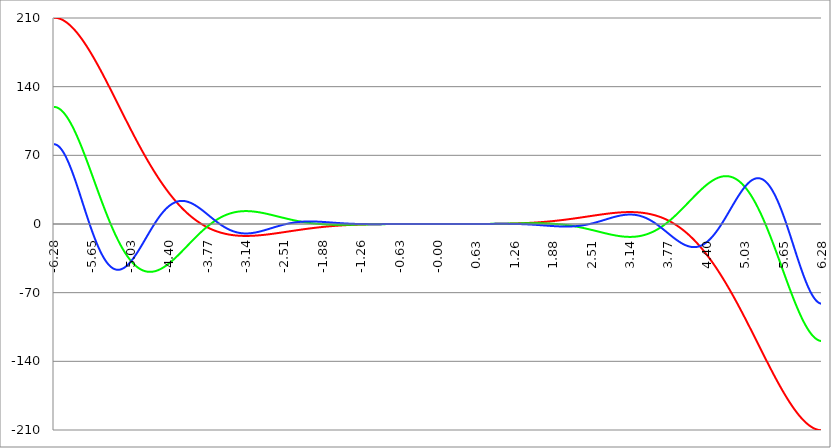
| Category | Series 1 | Series 0 | Series 2 |
|---|---|---|---|
| -6.283185307179586 | 210.351 | 119.313 | 81.287 |
| -6.276902121872407 | 210.346 | 119.303 | 81.272 |
| -6.270618936565228 | 210.332 | 119.274 | 81.229 |
| -6.264335751258049 | 210.307 | 119.225 | 81.156 |
| -6.25805256595087 | 210.273 | 119.157 | 81.054 |
| -6.25176938064369 | 210.23 | 119.07 | 80.924 |
| -6.245486195336511 | 210.177 | 118.965 | 80.765 |
| -6.23920301002933 | 210.115 | 118.84 | 80.578 |
| -6.232919824722153 | 210.043 | 118.696 | 80.364 |
| -6.226636639414973 | 209.962 | 118.535 | 80.121 |
| -6.220353454107794 | 209.871 | 118.354 | 79.852 |
| -6.214070268800615 | 209.772 | 118.155 | 79.555 |
| -6.207787083493435 | 209.663 | 117.939 | 79.231 |
| -6.201503898186257 | 209.545 | 117.704 | 78.881 |
| -6.195220712879077 | 209.419 | 117.451 | 78.504 |
| -6.188937527571898 | 209.283 | 117.181 | 78.101 |
| -6.182654342264719 | 209.138 | 116.893 | 77.673 |
| -6.17637115695754 | 208.985 | 116.588 | 77.219 |
| -6.170087971650361 | 208.823 | 116.266 | 76.74 |
| -6.163804786343182 | 208.652 | 115.926 | 76.237 |
| -6.157521601036002 | 208.472 | 115.57 | 75.709 |
| -6.151238415728823 | 208.284 | 115.196 | 75.157 |
| -6.144955230421644 | 208.087 | 114.807 | 74.581 |
| -6.138672045114464 | 207.882 | 114.401 | 73.982 |
| -6.132388859807286 | 207.669 | 113.978 | 73.36 |
| -6.126105674500106 | 207.447 | 113.54 | 72.716 |
| -6.119822489192927 | 207.217 | 113.086 | 72.049 |
| -6.113539303885748 | 206.979 | 112.616 | 71.36 |
| -6.107256118578569 | 206.732 | 112.13 | 70.65 |
| -6.10097293327139 | 206.478 | 111.629 | 69.919 |
| -6.09468974796421 | 206.215 | 111.113 | 69.167 |
| -6.088406562657031 | 205.945 | 110.582 | 68.394 |
| -6.082123377349852 | 205.666 | 110.036 | 67.602 |
| -6.075840192042672 | 205.38 | 109.475 | 66.791 |
| -6.069557006735494 | 205.086 | 108.9 | 65.96 |
| -6.063273821428314 | 204.784 | 108.311 | 65.111 |
| -6.056990636121135 | 204.475 | 107.708 | 64.243 |
| -6.050707450813956 | 204.158 | 107.091 | 63.358 |
| -6.044424265506777 | 203.834 | 106.46 | 62.456 |
| -6.038141080199597 | 203.502 | 105.815 | 61.536 |
| -6.031857894892418 | 203.162 | 105.158 | 60.6 |
| -6.025574709585239 | 202.816 | 104.487 | 59.649 |
| -6.01929152427806 | 202.462 | 103.803 | 58.681 |
| -6.013008338970881 | 202.101 | 103.107 | 57.699 |
| -6.006725153663701 | 201.733 | 102.398 | 56.702 |
| -6.000441968356522 | 201.358 | 101.676 | 55.69 |
| -5.994158783049343 | 200.975 | 100.943 | 54.665 |
| -5.987875597742164 | 200.586 | 100.198 | 53.627 |
| -5.981592412434984 | 200.19 | 99.441 | 52.576 |
| -5.975309227127805 | 199.787 | 98.672 | 51.512 |
| -5.969026041820626 | 199.378 | 97.892 | 50.437 |
| -5.962742856513447 | 198.962 | 97.101 | 49.35 |
| -5.956459671206268 | 198.539 | 96.299 | 48.253 |
| -5.950176485899088 | 198.109 | 95.487 | 47.145 |
| -5.94389330059191 | 197.673 | 94.664 | 46.027 |
| -5.93761011528473 | 197.231 | 93.831 | 44.899 |
| -5.931326929977551 | 196.782 | 92.987 | 43.763 |
| -5.925043744670372 | 196.327 | 92.134 | 42.618 |
| -5.918760559363193 | 195.866 | 91.271 | 41.464 |
| -5.912477374056014 | 195.399 | 90.399 | 40.304 |
| -5.906194188748834 | 194.925 | 89.517 | 39.136 |
| -5.899911003441655 | 194.446 | 88.626 | 37.961 |
| -5.893627818134476 | 193.96 | 87.727 | 36.781 |
| -5.887344632827297 | 193.469 | 86.819 | 35.594 |
| -5.881061447520117 | 192.971 | 85.902 | 34.402 |
| -5.874778262212938 | 192.468 | 84.978 | 33.206 |
| -5.868495076905759 | 191.96 | 84.045 | 32.005 |
| -5.86221189159858 | 191.445 | 83.105 | 30.801 |
| -5.855928706291401 | 190.925 | 82.157 | 29.593 |
| -5.849645520984221 | 190.399 | 81.201 | 28.382 |
| -5.843362335677042 | 189.868 | 80.239 | 27.169 |
| -5.837079150369863 | 189.332 | 79.27 | 25.954 |
| -5.830795965062684 | 188.79 | 78.294 | 24.737 |
| -5.824512779755505 | 188.243 | 77.311 | 23.52 |
| -5.818229594448325 | 187.691 | 76.322 | 22.301 |
| -5.811946409141146 | 187.133 | 75.327 | 21.083 |
| -5.805663223833967 | 186.571 | 74.326 | 19.865 |
| -5.799380038526788 | 186.003 | 73.32 | 18.647 |
| -5.793096853219609 | 185.431 | 72.308 | 17.431 |
| -5.78681366791243 | 184.853 | 71.291 | 16.217 |
| -5.780530482605251 | 184.271 | 70.268 | 15.004 |
| -5.774247297298071 | 183.684 | 69.241 | 13.794 |
| -5.767964111990892 | 183.092 | 68.21 | 12.588 |
| -5.761680926683713 | 182.496 | 67.174 | 11.384 |
| -5.755397741376534 | 181.895 | 66.133 | 10.184 |
| -5.749114556069355 | 181.289 | 65.089 | 8.989 |
| -5.742831370762175 | 180.679 | 64.041 | 7.798 |
| -5.736548185454996 | 180.065 | 62.989 | 6.612 |
| -5.730265000147816 | 179.446 | 61.934 | 5.431 |
| -5.723981814840638 | 178.823 | 60.876 | 4.256 |
| -5.717698629533459 | 178.196 | 59.814 | 3.088 |
| -5.711415444226279 | 177.565 | 58.75 | 1.926 |
| -5.7051322589191 | 176.929 | 57.684 | 0.771 |
| -5.698849073611921 | 176.29 | 56.615 | -0.376 |
| -5.692565888304742 | 175.646 | 55.544 | -1.516 |
| -5.686282702997562 | 174.999 | 54.47 | -2.647 |
| -5.679999517690383 | 174.347 | 53.395 | -3.771 |
| -5.673716332383204 | 173.692 | 52.319 | -4.885 |
| -5.667433147076025 | 173.034 | 51.241 | -5.99 |
| -5.661149961768846 | 172.371 | 50.162 | -7.085 |
| -5.654866776461667 | 171.705 | 49.082 | -8.171 |
| -5.648583591154487 | 171.036 | 48.001 | -9.246 |
| -5.642300405847308 | 170.362 | 46.919 | -10.311 |
| -5.63601722054013 | 169.686 | 45.837 | -11.365 |
| -5.62973403523295 | 169.006 | 44.755 | -12.408 |
| -5.623450849925771 | 168.323 | 43.673 | -13.439 |
| -5.617167664618591 | 167.636 | 42.59 | -14.459 |
| -5.610884479311412 | 166.947 | 41.509 | -15.466 |
| -5.604601294004233 | 166.254 | 40.427 | -16.461 |
| -5.598318108697054 | 165.558 | 39.347 | -17.444 |
| -5.592034923389875 | 164.859 | 38.267 | -18.413 |
| -5.585751738082695 | 164.157 | 37.188 | -19.369 |
| -5.579468552775516 | 163.453 | 36.111 | -20.312 |
| -5.573185367468337 | 162.745 | 35.035 | -21.241 |
| -5.566902182161157 | 162.035 | 33.96 | -22.156 |
| -5.560618996853979 | 161.322 | 32.887 | -23.056 |
| -5.5543358115468 | 160.606 | 31.817 | -23.943 |
| -5.54805262623962 | 159.888 | 30.748 | -24.814 |
| -5.54176944093244 | 159.167 | 29.682 | -25.671 |
| -5.535486255625262 | 158.443 | 28.618 | -26.512 |
| -5.529203070318083 | 157.717 | 27.556 | -27.338 |
| -5.522919885010904 | 156.989 | 26.498 | -28.149 |
| -5.516636699703724 | 156.259 | 25.442 | -28.944 |
| -5.510353514396545 | 155.526 | 24.389 | -29.723 |
| -5.504070329089366 | 154.791 | 23.34 | -30.485 |
| -5.497787143782186 | 154.053 | 22.294 | -31.232 |
| -5.491503958475008 | 153.314 | 21.252 | -31.962 |
| -5.485220773167828 | 152.573 | 20.213 | -32.675 |
| -5.47893758786065 | 151.829 | 19.179 | -33.372 |
| -5.47265440255347 | 151.084 | 18.148 | -34.052 |
| -5.466371217246291 | 150.337 | 17.122 | -34.715 |
| -5.460088031939112 | 149.588 | 16.1 | -35.36 |
| -5.453804846631932 | 148.837 | 15.082 | -35.988 |
| -5.447521661324753 | 148.084 | 14.069 | -36.599 |
| -5.441238476017574 | 147.33 | 13.061 | -37.193 |
| -5.434955290710395 | 146.574 | 12.058 | -37.769 |
| -5.428672105403215 | 145.817 | 11.059 | -38.327 |
| -5.422388920096036 | 145.058 | 10.066 | -38.867 |
| -5.416105734788857 | 144.298 | 9.079 | -39.39 |
| -5.409822549481678 | 143.536 | 8.096 | -39.894 |
| -5.403539364174499 | 142.773 | 7.12 | -40.381 |
| -5.39725617886732 | 142.008 | 6.149 | -40.849 |
| -5.39097299356014 | 141.242 | 5.184 | -41.3 |
| -5.384689808252961 | 140.475 | 4.225 | -41.732 |
| -5.378406622945782 | 139.707 | 3.272 | -42.146 |
| -5.372123437638603 | 138.938 | 2.325 | -42.542 |
| -5.365840252331424 | 138.168 | 1.385 | -42.92 |
| -5.359557067024244 | 137.397 | 0.451 | -43.28 |
| -5.353273881717065 | 136.625 | -0.476 | -43.621 |
| -5.346990696409886 | 135.851 | -1.397 | -43.944 |
| -5.340707511102707 | 135.078 | -2.31 | -44.249 |
| -5.334424325795528 | 134.303 | -3.217 | -44.535 |
| -5.328141140488348 | 133.527 | -4.117 | -44.804 |
| -5.32185795518117 | 132.751 | -5.01 | -45.054 |
| -5.31557476987399 | 131.974 | -5.895 | -45.287 |
| -5.30929158456681 | 131.197 | -6.773 | -45.501 |
| -5.303008399259631 | 130.419 | -7.644 | -45.697 |
| -5.296725213952453 | 129.64 | -8.507 | -45.875 |
| -5.290442028645273 | 128.861 | -9.362 | -46.035 |
| -5.284158843338094 | 128.082 | -10.21 | -46.178 |
| -5.277875658030915 | 127.302 | -11.049 | -46.302 |
| -5.271592472723735 | 126.522 | -11.881 | -46.409 |
| -5.265309287416557 | 125.742 | -12.705 | -46.499 |
| -5.259026102109377 | 124.961 | -13.521 | -46.57 |
| -5.252742916802198 | 124.18 | -14.328 | -46.625 |
| -5.246459731495019 | 123.399 | -15.128 | -46.662 |
| -5.24017654618784 | 122.618 | -15.919 | -46.682 |
| -5.23389336088066 | 121.837 | -16.701 | -46.685 |
| -5.227610175573481 | 121.056 | -17.475 | -46.671 |
| -5.221326990266302 | 120.275 | -18.241 | -46.64 |
| -5.215043804959122 | 119.494 | -18.997 | -46.592 |
| -5.208760619651944 | 118.713 | -19.745 | -46.528 |
| -5.202477434344764 | 117.932 | -20.485 | -46.447 |
| -5.196194249037585 | 117.152 | -21.215 | -46.35 |
| -5.189911063730406 | 116.372 | -21.937 | -46.237 |
| -5.183627878423227 | 115.592 | -22.649 | -46.108 |
| -5.177344693116048 | 114.812 | -23.353 | -45.963 |
| -5.171061507808868 | 114.033 | -24.047 | -45.803 |
| -5.164778322501689 | 113.254 | -24.732 | -45.627 |
| -5.15849513719451 | 112.476 | -25.408 | -45.436 |
| -5.152211951887331 | 111.698 | -26.075 | -45.23 |
| -5.145928766580152 | 110.921 | -26.732 | -45.009 |
| -5.139645581272972 | 110.144 | -27.381 | -44.773 |
| -5.133362395965793 | 109.368 | -28.019 | -44.523 |
| -5.127079210658614 | 108.593 | -28.649 | -44.258 |
| -5.120796025351435 | 107.818 | -29.268 | -43.979 |
| -5.114512840044256 | 107.044 | -29.879 | -43.686 |
| -5.108229654737076 | 106.271 | -30.479 | -43.38 |
| -5.101946469429897 | 105.499 | -31.07 | -43.06 |
| -5.095663284122718 | 104.727 | -31.652 | -42.727 |
| -5.08938009881554 | 103.956 | -32.224 | -42.381 |
| -5.08309691350836 | 103.187 | -32.786 | -42.022 |
| -5.07681372820118 | 102.418 | -33.338 | -41.65 |
| -5.070530542894002 | 101.651 | -33.881 | -41.266 |
| -5.064247357586822 | 100.884 | -34.414 | -40.87 |
| -5.057964172279643 | 100.118 | -34.937 | -40.462 |
| -5.051680986972464 | 99.354 | -35.45 | -40.042 |
| -5.045397801665285 | 98.591 | -35.954 | -39.611 |
| -5.039114616358106 | 97.829 | -36.448 | -39.169 |
| -5.032831431050926 | 97.068 | -36.931 | -38.716 |
| -5.026548245743747 | 96.308 | -37.405 | -38.252 |
| -5.020265060436568 | 95.55 | -37.87 | -37.778 |
| -5.013981875129389 | 94.793 | -38.324 | -37.293 |
| -5.00769868982221 | 94.038 | -38.768 | -36.799 |
| -5.00141550451503 | 93.283 | -39.203 | -36.295 |
| -4.995132319207851 | 92.531 | -39.627 | -35.782 |
| -4.98884913390067 | 91.779 | -40.042 | -35.26 |
| -4.982565948593493 | 91.03 | -40.447 | -34.728 |
| -4.976282763286313 | 90.281 | -40.841 | -34.189 |
| -4.969999577979134 | 89.535 | -41.226 | -33.64 |
| -4.963716392671955 | 88.79 | -41.602 | -33.084 |
| -4.957433207364776 | 88.046 | -41.967 | -32.52 |
| -4.951150022057597 | 87.304 | -42.322 | -31.949 |
| -4.944866836750418 | 86.564 | -42.668 | -31.37 |
| -4.938583651443238 | 85.826 | -43.004 | -30.784 |
| -4.932300466136059 | 85.089 | -43.329 | -30.192 |
| -4.92601728082888 | 84.354 | -43.646 | -29.593 |
| -4.9197340955217 | 83.621 | -43.952 | -28.988 |
| -4.913450910214521 | 82.89 | -44.248 | -28.377 |
| -4.907167724907342 | 82.161 | -44.535 | -27.76 |
| -4.900884539600163 | 81.433 | -44.812 | -27.138 |
| -4.894601354292984 | 80.708 | -45.08 | -26.511 |
| -4.888318168985805 | 79.984 | -45.338 | -25.88 |
| -4.882034983678625 | 79.262 | -45.586 | -25.243 |
| -4.875751798371446 | 78.543 | -45.824 | -24.603 |
| -4.869468613064267 | 77.825 | -46.053 | -23.958 |
| -4.863185427757088 | 77.11 | -46.273 | -23.31 |
| -4.856902242449909 | 76.396 | -46.483 | -22.658 |
| -4.85061905714273 | 75.685 | -46.683 | -22.004 |
| -4.84433587183555 | 74.976 | -46.874 | -21.346 |
| -4.838052686528371 | 74.269 | -47.056 | -20.686 |
| -4.831769501221192 | 73.564 | -47.228 | -20.023 |
| -4.825486315914013 | 72.861 | -47.391 | -19.358 |
| -4.819203130606833 | 72.161 | -47.545 | -18.691 |
| -4.812919945299654 | 71.463 | -47.689 | -18.023 |
| -4.806636759992475 | 70.767 | -47.824 | -17.354 |
| -4.800353574685296 | 70.074 | -47.951 | -16.683 |
| -4.794070389378117 | 69.382 | -48.068 | -16.012 |
| -4.787787204070938 | 68.694 | -48.176 | -15.34 |
| -4.781504018763758 | 68.007 | -48.275 | -14.668 |
| -4.77522083345658 | 67.323 | -48.365 | -13.996 |
| -4.7689376481494 | 66.642 | -48.446 | -13.324 |
| -4.762654462842221 | 65.962 | -48.519 | -12.653 |
| -4.756371277535042 | 65.286 | -48.583 | -11.982 |
| -4.750088092227862 | 64.612 | -48.638 | -11.312 |
| -4.743804906920683 | 63.94 | -48.684 | -10.644 |
| -4.737521721613504 | 63.271 | -48.722 | -9.977 |
| -4.731238536306324 | 62.604 | -48.751 | -9.311 |
| -4.724955350999146 | 61.94 | -48.772 | -8.648 |
| -4.718672165691966 | 61.279 | -48.785 | -7.987 |
| -4.712388980384787 | 60.62 | -48.789 | -7.328 |
| -4.706105795077608 | 59.964 | -48.785 | -6.672 |
| -4.699822609770429 | 59.31 | -48.772 | -6.019 |
| -4.69353942446325 | 58.659 | -48.752 | -5.368 |
| -4.68725623915607 | 58.011 | -48.723 | -4.722 |
| -4.680973053848891 | 57.366 | -48.687 | -4.078 |
| -4.674689868541712 | 56.723 | -48.643 | -3.438 |
| -4.668406683234533 | 56.083 | -48.59 | -2.803 |
| -4.662123497927354 | 55.445 | -48.53 | -2.171 |
| -4.655840312620174 | 54.811 | -48.462 | -1.544 |
| -4.649557127312995 | 54.179 | -48.387 | -0.921 |
| -4.643273942005816 | 53.55 | -48.304 | -0.303 |
| -4.636990756698637 | 52.924 | -48.214 | 0.31 |
| -4.630707571391458 | 52.301 | -48.116 | 0.918 |
| -4.624424386084279 | 51.681 | -48.011 | 1.52 |
| -4.618141200777099 | 51.063 | -47.899 | 2.117 |
| -4.61185801546992 | 50.448 | -47.779 | 2.709 |
| -4.605574830162741 | 49.837 | -47.652 | 3.294 |
| -4.599291644855561 | 49.228 | -47.519 | 3.874 |
| -4.593008459548383 | 48.622 | -47.378 | 4.447 |
| -4.586725274241203 | 48.019 | -47.231 | 5.014 |
| -4.580442088934024 | 47.419 | -47.077 | 5.575 |
| -4.574158903626845 | 46.822 | -46.916 | 6.128 |
| -4.567875718319666 | 46.228 | -46.748 | 6.675 |
| -4.561592533012487 | 45.637 | -46.575 | 7.215 |
| -4.555309347705307 | 45.048 | -46.394 | 7.748 |
| -4.549026162398128 | 44.463 | -46.207 | 8.274 |
| -4.542742977090949 | 43.881 | -46.015 | 8.792 |
| -4.53645979178377 | 43.302 | -45.815 | 9.302 |
| -4.530176606476591 | 42.726 | -45.61 | 9.805 |
| -4.523893421169412 | 42.153 | -45.399 | 10.3 |
| -4.517610235862232 | 41.583 | -45.182 | 10.788 |
| -4.511327050555053 | 41.017 | -44.959 | 11.267 |
| -4.505043865247874 | 40.453 | -44.73 | 11.738 |
| -4.498760679940694 | 39.892 | -44.496 | 12.2 |
| -4.492477494633515 | 39.335 | -44.256 | 12.655 |
| -4.486194309326336 | 38.78 | -44.011 | 13.101 |
| -4.479911124019157 | 38.229 | -43.76 | 13.538 |
| -4.473627938711977 | 37.681 | -43.504 | 13.967 |
| -4.467344753404799 | 37.136 | -43.243 | 14.387 |
| -4.46106156809762 | 36.594 | -42.977 | 14.798 |
| -4.45477838279044 | 36.055 | -42.706 | 15.2 |
| -4.44849519748326 | 35.52 | -42.43 | 15.593 |
| -4.442212012176082 | 34.987 | -42.149 | 15.977 |
| -4.435928826868903 | 34.458 | -41.863 | 16.352 |
| -4.429645641561723 | 33.932 | -41.573 | 16.718 |
| -4.423362456254544 | 33.409 | -41.278 | 17.074 |
| -4.417079270947365 | 32.89 | -40.979 | 17.422 |
| -4.410796085640185 | 32.373 | -40.675 | 17.759 |
| -4.404512900333007 | 31.86 | -40.367 | 18.088 |
| -4.398229715025827 | 31.35 | -40.055 | 18.407 |
| -4.391946529718648 | 30.843 | -39.739 | 18.716 |
| -4.38566334441147 | 30.339 | -39.418 | 19.016 |
| -4.37938015910429 | 29.839 | -39.094 | 19.307 |
| -4.373096973797111 | 29.342 | -38.766 | 19.587 |
| -4.366813788489932 | 28.848 | -38.434 | 19.858 |
| -4.360530603182752 | 28.357 | -38.099 | 20.12 |
| -4.354247417875573 | 27.87 | -37.76 | 20.372 |
| -4.347964232568394 | 27.386 | -37.418 | 20.614 |
| -4.341681047261215 | 26.905 | -37.072 | 20.847 |
| -4.335397861954035 | 26.427 | -36.724 | 21.069 |
| -4.329114676646856 | 25.953 | -36.371 | 21.282 |
| -4.322831491339677 | 25.482 | -36.016 | 21.486 |
| -4.316548306032498 | 25.014 | -35.658 | 21.68 |
| -4.310265120725319 | 24.549 | -35.297 | 21.864 |
| -4.30398193541814 | 24.088 | -34.933 | 22.038 |
| -4.29769875011096 | 23.63 | -34.567 | 22.203 |
| -4.291415564803781 | 23.175 | -34.198 | 22.359 |
| -4.285132379496602 | 22.723 | -33.826 | 22.504 |
| -4.278849194189422 | 22.275 | -33.452 | 22.64 |
| -4.272566008882244 | 21.83 | -33.076 | 22.767 |
| -4.266282823575064 | 21.388 | -32.697 | 22.884 |
| -4.259999638267885 | 20.95 | -32.316 | 22.992 |
| -4.253716452960706 | 20.514 | -31.933 | 23.09 |
| -4.247433267653527 | 20.082 | -31.548 | 23.179 |
| -4.241150082346347 | 19.654 | -31.161 | 23.259 |
| -4.234866897039168 | 19.228 | -30.773 | 23.329 |
| -4.228583711731989 | 18.806 | -30.382 | 23.39 |
| -4.22230052642481 | 18.387 | -29.99 | 23.442 |
| -4.216017341117631 | 17.971 | -29.596 | 23.485 |
| -4.209734155810452 | 17.559 | -29.201 | 23.519 |
| -4.203450970503273 | 17.15 | -28.805 | 23.544 |
| -4.197167785196093 | 16.744 | -28.407 | 23.56 |
| -4.190884599888914 | 16.341 | -28.008 | 23.567 |
| -4.184601414581734 | 15.942 | -27.608 | 23.566 |
| -4.178318229274556 | 15.546 | -27.207 | 23.556 |
| -4.172035043967377 | 15.153 | -26.805 | 23.537 |
| -4.165751858660197 | 14.763 | -26.402 | 23.51 |
| -4.159468673353018 | 14.377 | -25.998 | 23.475 |
| -4.153185488045839 | 13.994 | -25.594 | 23.431 |
| -4.14690230273866 | 13.614 | -25.188 | 23.379 |
| -4.140619117431481 | 13.237 | -24.783 | 23.318 |
| -4.134335932124301 | 12.864 | -24.377 | 23.25 |
| -4.128052746817122 | 12.493 | -23.97 | 23.174 |
| -4.121769561509943 | 12.126 | -23.563 | 23.09 |
| -4.115486376202764 | 11.762 | -23.156 | 22.998 |
| -4.109203190895584 | 11.402 | -22.749 | 22.899 |
| -4.102920005588405 | 11.044 | -22.341 | 22.792 |
| -4.096636820281226 | 10.69 | -21.934 | 22.678 |
| -4.090353634974047 | 10.339 | -21.527 | 22.556 |
| -4.084070449666868 | 9.991 | -21.12 | 22.428 |
| -4.077787264359689 | 9.646 | -20.713 | 22.292 |
| -4.071504079052509 | 9.305 | -20.306 | 22.149 |
| -4.06522089374533 | 8.967 | -19.9 | 22 |
| -4.058937708438151 | 8.631 | -19.494 | 21.843 |
| -4.052654523130972 | 8.299 | -19.088 | 21.68 |
| -4.046371337823793 | 7.971 | -18.684 | 21.511 |
| -4.040088152516613 | 7.645 | -18.28 | 21.336 |
| -4.033804967209434 | 7.322 | -17.876 | 21.154 |
| -4.027521781902255 | 7.003 | -17.473 | 20.966 |
| -4.021238596595076 | 6.686 | -17.072 | 20.772 |
| -4.014955411287897 | 6.373 | -16.671 | 20.572 |
| -4.008672225980717 | 6.063 | -16.271 | 20.367 |
| -4.002389040673538 | 5.756 | -15.872 | 20.156 |
| -3.996105855366359 | 5.452 | -15.474 | 19.939 |
| -3.989822670059179 | 5.151 | -15.078 | 19.718 |
| -3.983539484752 | 4.853 | -14.683 | 19.491 |
| -3.97725629944482 | 4.559 | -14.289 | 19.259 |
| -3.97097311413764 | 4.267 | -13.896 | 19.022 |
| -3.96468992883046 | 3.978 | -13.505 | 18.781 |
| -3.958406743523281 | 3.693 | -13.115 | 18.534 |
| -3.952123558216101 | 3.41 | -12.727 | 18.284 |
| -3.945840372908922 | 3.13 | -12.34 | 18.029 |
| -3.939557187601742 | 2.854 | -11.956 | 17.77 |
| -3.933274002294562 | 2.58 | -11.572 | 17.506 |
| -3.926990816987382 | 2.31 | -11.191 | 17.239 |
| -3.920707631680203 | 2.042 | -10.811 | 16.968 |
| -3.914424446373023 | 1.778 | -10.434 | 16.694 |
| -3.908141261065844 | 1.516 | -10.058 | 16.416 |
| -3.901858075758664 | 1.257 | -9.684 | 16.134 |
| -3.895574890451484 | 1.002 | -9.312 | 15.85 |
| -3.889291705144305 | 0.749 | -8.943 | 15.562 |
| -3.883008519837125 | 0.499 | -8.575 | 15.271 |
| -3.876725334529945 | 0.252 | -8.21 | 14.978 |
| -3.870442149222766 | 0.008 | -7.847 | 14.682 |
| -3.864158963915586 | -0.233 | -7.486 | 14.383 |
| -3.857875778608407 | -0.472 | -7.127 | 14.082 |
| -3.851592593301227 | -0.707 | -6.771 | 13.779 |
| -3.845309407994047 | -0.94 | -6.418 | 13.474 |
| -3.839026222686868 | -1.169 | -6.066 | 13.166 |
| -3.832743037379688 | -1.396 | -5.718 | 12.857 |
| -3.826459852072508 | -1.62 | -5.371 | 12.546 |
| -3.820176666765329 | -1.842 | -5.028 | 12.234 |
| -3.813893481458149 | -2.06 | -4.687 | 11.92 |
| -3.807610296150969 | -2.276 | -4.348 | 11.605 |
| -3.80132711084379 | -2.489 | -4.013 | 11.289 |
| -3.79504392553661 | -2.699 | -3.68 | 10.972 |
| -3.78876074022943 | -2.906 | -3.35 | 10.653 |
| -3.782477554922251 | -3.111 | -3.022 | 10.335 |
| -3.776194369615071 | -3.313 | -2.698 | 10.015 |
| -3.769911184307892 | -3.512 | -2.376 | 9.695 |
| -3.763627999000712 | -3.709 | -2.057 | 9.375 |
| -3.757344813693532 | -3.903 | -1.742 | 9.054 |
| -3.751061628386352 | -4.094 | -1.429 | 8.734 |
| -3.744778443079173 | -4.282 | -1.119 | 8.413 |
| -3.738495257771993 | -4.468 | -0.812 | 8.092 |
| -3.732212072464814 | -4.651 | -0.509 | 7.772 |
| -3.725928887157634 | -4.832 | -0.208 | 7.452 |
| -3.719645701850454 | -5.01 | 0.09 | 7.133 |
| -3.713362516543275 | -5.185 | 0.384 | 6.814 |
| -3.707079331236095 | -5.358 | 0.675 | 6.496 |
| -3.700796145928915 | -5.528 | 0.963 | 6.179 |
| -3.694512960621736 | -5.696 | 1.248 | 5.863 |
| -3.688229775314556 | -5.861 | 1.53 | 5.548 |
| -3.681946590007376 | -6.024 | 1.808 | 5.234 |
| -3.675663404700197 | -6.184 | 2.083 | 4.922 |
| -3.669380219393017 | -6.341 | 2.355 | 4.61 |
| -3.663097034085838 | -6.496 | 2.623 | 4.301 |
| -3.656813848778658 | -6.649 | 2.888 | 3.993 |
| -3.650530663471478 | -6.799 | 3.15 | 3.687 |
| -3.644247478164299 | -6.947 | 3.409 | 3.382 |
| -3.63796429285712 | -7.092 | 3.664 | 3.08 |
| -3.631681107549939 | -7.235 | 3.915 | 2.779 |
| -3.62539792224276 | -7.376 | 4.164 | 2.481 |
| -3.61911473693558 | -7.514 | 4.408 | 2.185 |
| -3.612831551628401 | -7.649 | 4.65 | 1.891 |
| -3.606548366321221 | -7.783 | 4.888 | 1.599 |
| -3.600265181014041 | -7.914 | 5.122 | 1.31 |
| -3.593981995706862 | -8.042 | 5.353 | 1.024 |
| -3.587698810399682 | -8.169 | 5.581 | 0.74 |
| -3.581415625092502 | -8.293 | 5.805 | 0.459 |
| -3.575132439785323 | -8.414 | 6.026 | 0.181 |
| -3.568849254478143 | -8.534 | 6.243 | -0.094 |
| -3.562566069170964 | -8.651 | 6.457 | -0.366 |
| -3.556282883863784 | -8.766 | 6.667 | -0.635 |
| -3.549999698556604 | -8.879 | 6.874 | -0.902 |
| -3.543716513249425 | -8.989 | 7.077 | -1.164 |
| -3.537433327942245 | -9.098 | 7.276 | -1.424 |
| -3.531150142635065 | -9.204 | 7.473 | -1.68 |
| -3.524866957327886 | -9.308 | 7.665 | -1.933 |
| -3.518583772020706 | -9.41 | 7.854 | -2.183 |
| -3.512300586713526 | -9.509 | 8.04 | -2.428 |
| -3.506017401406347 | -9.607 | 8.222 | -2.671 |
| -3.499734216099167 | -9.702 | 8.401 | -2.909 |
| -3.493451030791987 | -9.796 | 8.576 | -3.144 |
| -3.487167845484808 | -9.887 | 8.747 | -3.376 |
| -3.480884660177628 | -9.976 | 8.915 | -3.603 |
| -3.474601474870449 | -10.063 | 9.08 | -3.827 |
| -3.468318289563269 | -10.149 | 9.241 | -4.046 |
| -3.462035104256089 | -10.232 | 9.399 | -4.262 |
| -3.45575191894891 | -10.313 | 9.553 | -4.474 |
| -3.44946873364173 | -10.392 | 9.703 | -4.682 |
| -3.44318554833455 | -10.469 | 9.851 | -4.885 |
| -3.436902363027371 | -10.544 | 9.994 | -5.085 |
| -3.430619177720191 | -10.618 | 10.135 | -5.28 |
| -3.424335992413011 | -10.689 | 10.272 | -5.472 |
| -3.418052807105832 | -10.758 | 10.405 | -5.659 |
| -3.411769621798652 | -10.826 | 10.535 | -5.842 |
| -3.405486436491473 | -10.892 | 10.662 | -6.021 |
| -3.399203251184293 | -10.955 | 10.785 | -6.195 |
| -3.392920065877113 | -11.017 | 10.905 | -6.365 |
| -3.386636880569934 | -11.077 | 11.022 | -6.531 |
| -3.380353695262754 | -11.136 | 11.135 | -6.693 |
| -3.374070509955574 | -11.192 | 11.245 | -6.85 |
| -3.367787324648395 | -11.247 | 11.351 | -7.003 |
| -3.361504139341215 | -11.3 | 11.455 | -7.151 |
| -3.355220954034035 | -11.351 | 11.555 | -7.295 |
| -3.348937768726855 | -11.401 | 11.651 | -7.435 |
| -3.342654583419676 | -11.448 | 11.745 | -7.57 |
| -3.336371398112496 | -11.494 | 11.835 | -7.701 |
| -3.330088212805317 | -11.539 | 11.922 | -7.828 |
| -3.323805027498137 | -11.581 | 12.006 | -7.95 |
| -3.317521842190957 | -11.622 | 12.086 | -8.067 |
| -3.311238656883778 | -11.662 | 12.164 | -8.181 |
| -3.304955471576598 | -11.699 | 12.238 | -8.29 |
| -3.298672286269419 | -11.735 | 12.31 | -8.394 |
| -3.292389100962239 | -11.77 | 12.378 | -8.495 |
| -3.286105915655059 | -11.803 | 12.443 | -8.59 |
| -3.27982273034788 | -11.834 | 12.505 | -8.682 |
| -3.2735395450407 | -11.864 | 12.564 | -8.769 |
| -3.26725635973352 | -11.892 | 12.62 | -8.852 |
| -3.260973174426341 | -11.919 | 12.673 | -8.93 |
| -3.254689989119161 | -11.944 | 12.723 | -9.005 |
| -3.248406803811982 | -11.968 | 12.77 | -9.075 |
| -3.242123618504802 | -11.99 | 12.814 | -9.14 |
| -3.235840433197622 | -12.011 | 12.856 | -9.202 |
| -3.229557247890442 | -12.03 | 12.894 | -9.259 |
| -3.223274062583263 | -12.048 | 12.93 | -9.312 |
| -3.216990877276083 | -12.064 | 12.962 | -9.361 |
| -3.210707691968904 | -12.079 | 12.992 | -9.406 |
| -3.204424506661724 | -12.093 | 13.02 | -9.447 |
| -3.198141321354544 | -12.105 | 13.044 | -9.484 |
| -3.191858136047365 | -12.116 | 13.066 | -9.516 |
| -3.185574950740185 | -12.126 | 13.085 | -9.545 |
| -3.179291765433005 | -12.134 | 13.102 | -9.57 |
| -3.173008580125826 | -12.141 | 13.116 | -9.591 |
| -3.166725394818646 | -12.147 | 13.127 | -9.607 |
| -3.160442209511467 | -12.151 | 13.136 | -9.621 |
| -3.154159024204287 | -12.154 | 13.142 | -9.63 |
| -3.147875838897107 | -12.156 | 13.146 | -9.635 |
| -3.141592653589928 | -12.157 | 13.147 | -9.637 |
| -3.135309468282748 | -12.156 | 13.146 | -9.635 |
| -3.129026282975568 | -12.154 | 13.142 | -9.63 |
| -3.122743097668389 | -12.151 | 13.136 | -9.621 |
| -3.116459912361209 | -12.147 | 13.128 | -9.608 |
| -3.110176727054029 | -12.142 | 13.117 | -9.592 |
| -3.10389354174685 | -12.135 | 13.104 | -9.573 |
| -3.09761035643967 | -12.128 | 13.089 | -9.55 |
| -3.09132717113249 | -12.119 | 13.071 | -9.524 |
| -3.085043985825311 | -12.109 | 13.051 | -9.494 |
| -3.078760800518131 | -12.098 | 13.03 | -9.461 |
| -3.072477615210952 | -12.086 | 13.005 | -9.425 |
| -3.066194429903772 | -12.073 | 12.979 | -9.386 |
| -3.059911244596592 | -12.059 | 12.951 | -9.344 |
| -3.053628059289413 | -12.043 | 12.921 | -9.299 |
| -3.047344873982233 | -12.027 | 12.888 | -9.251 |
| -3.041061688675053 | -12.01 | 12.854 | -9.2 |
| -3.034778503367874 | -11.992 | 12.818 | -9.146 |
| -3.028495318060694 | -11.973 | 12.78 | -9.089 |
| -3.022212132753515 | -11.952 | 12.74 | -9.03 |
| -3.015928947446335 | -11.931 | 12.698 | -8.968 |
| -3.009645762139155 | -11.909 | 12.654 | -8.903 |
| -3.003362576831975 | -11.886 | 12.608 | -8.836 |
| -2.997079391524796 | -11.862 | 12.561 | -8.766 |
| -2.990796206217616 | -11.837 | 12.512 | -8.694 |
| -2.984513020910436 | -11.812 | 12.461 | -8.619 |
| -2.978229835603257 | -11.785 | 12.409 | -8.542 |
| -2.971946650296077 | -11.758 | 12.355 | -8.463 |
| -2.965663464988898 | -11.729 | 12.299 | -8.381 |
| -2.959380279681718 | -11.7 | 12.242 | -8.298 |
| -2.953097094374538 | -11.67 | 12.183 | -8.212 |
| -2.946813909067359 | -11.64 | 12.123 | -8.124 |
| -2.94053072376018 | -11.608 | 12.061 | -8.035 |
| -2.934247538453 | -11.576 | 11.997 | -7.943 |
| -2.92796435314582 | -11.543 | 11.933 | -7.85 |
| -2.92168116783864 | -11.509 | 11.867 | -7.754 |
| -2.915397982531461 | -11.475 | 11.799 | -7.658 |
| -2.909114797224281 | -11.439 | 11.731 | -7.559 |
| -2.902831611917101 | -11.403 | 11.661 | -7.459 |
| -2.896548426609922 | -11.367 | 11.589 | -7.357 |
| -2.890265241302742 | -11.329 | 11.517 | -7.254 |
| -2.883982055995562 | -11.291 | 11.443 | -7.149 |
| -2.877698870688383 | -11.252 | 11.368 | -7.044 |
| -2.871415685381203 | -11.213 | 11.292 | -6.936 |
| -2.865132500074023 | -11.173 | 11.215 | -6.828 |
| -2.858849314766844 | -11.132 | 11.137 | -6.718 |
| -2.852566129459664 | -11.091 | 11.058 | -6.608 |
| -2.846282944152485 | -11.049 | 10.978 | -6.496 |
| -2.839999758845305 | -11.007 | 10.897 | -6.383 |
| -2.833716573538125 | -10.964 | 10.815 | -6.27 |
| -2.827433388230946 | -10.92 | 10.732 | -6.155 |
| -2.821150202923766 | -10.876 | 10.648 | -6.04 |
| -2.814867017616586 | -10.831 | 10.563 | -5.924 |
| -2.808583832309407 | -10.786 | 10.477 | -5.807 |
| -2.802300647002227 | -10.74 | 10.391 | -5.69 |
| -2.796017461695047 | -10.694 | 10.304 | -5.572 |
| -2.789734276387867 | -10.647 | 10.216 | -5.453 |
| -2.783451091080688 | -10.6 | 10.127 | -5.335 |
| -2.777167905773509 | -10.552 | 10.038 | -5.215 |
| -2.770884720466329 | -10.504 | 9.948 | -5.095 |
| -2.764601535159149 | -10.455 | 9.857 | -4.975 |
| -2.75831834985197 | -10.406 | 9.766 | -4.855 |
| -2.75203516454479 | -10.357 | 9.674 | -4.735 |
| -2.74575197923761 | -10.307 | 9.582 | -4.614 |
| -2.739468793930431 | -10.256 | 9.489 | -4.494 |
| -2.733185608623251 | -10.206 | 9.396 | -4.373 |
| -2.726902423316071 | -10.155 | 9.302 | -4.252 |
| -2.720619238008892 | -10.103 | 9.208 | -4.132 |
| -2.714336052701712 | -10.051 | 9.114 | -4.011 |
| -2.708052867394532 | -9.999 | 9.019 | -3.891 |
| -2.701769682087352 | -9.946 | 8.923 | -3.771 |
| -2.695486496780173 | -9.893 | 8.828 | -3.651 |
| -2.689203311472993 | -9.84 | 8.732 | -3.531 |
| -2.682920126165814 | -9.787 | 8.635 | -3.412 |
| -2.676636940858634 | -9.733 | 8.539 | -3.293 |
| -2.670353755551454 | -9.678 | 8.442 | -3.175 |
| -2.664070570244275 | -9.624 | 8.345 | -3.057 |
| -2.657787384937095 | -9.569 | 8.248 | -2.939 |
| -2.651504199629916 | -9.514 | 8.151 | -2.822 |
| -2.645221014322736 | -9.459 | 8.054 | -2.706 |
| -2.638937829015556 | -9.404 | 7.956 | -2.591 |
| -2.632654643708377 | -9.348 | 7.859 | -2.476 |
| -2.626371458401197 | -9.292 | 7.761 | -2.362 |
| -2.620088273094018 | -9.236 | 7.664 | -2.248 |
| -2.613805087786838 | -9.179 | 7.566 | -2.136 |
| -2.607521902479658 | -9.123 | 7.468 | -2.024 |
| -2.601238717172478 | -9.066 | 7.371 | -1.913 |
| -2.594955531865299 | -9.009 | 7.273 | -1.803 |
| -2.588672346558119 | -8.952 | 7.176 | -1.694 |
| -2.58238916125094 | -8.894 | 7.078 | -1.586 |
| -2.57610597594376 | -8.837 | 6.981 | -1.479 |
| -2.56982279063658 | -8.779 | 6.884 | -1.373 |
| -2.563539605329401 | -8.721 | 6.787 | -1.268 |
| -2.557256420022221 | -8.664 | 6.69 | -1.164 |
| -2.550973234715042 | -8.606 | 6.594 | -1.061 |
| -2.544690049407862 | -8.547 | 6.497 | -0.959 |
| -2.538406864100682 | -8.489 | 6.401 | -0.859 |
| -2.532123678793503 | -8.431 | 6.305 | -0.76 |
| -2.525840493486323 | -8.372 | 6.21 | -0.662 |
| -2.519557308179143 | -8.314 | 6.114 | -0.565 |
| -2.513274122871964 | -8.255 | 6.019 | -0.469 |
| -2.506990937564784 | -8.197 | 5.925 | -0.375 |
| -2.500707752257604 | -8.138 | 5.83 | -0.282 |
| -2.494424566950425 | -8.079 | 5.736 | -0.191 |
| -2.488141381643245 | -8.02 | 5.643 | -0.1 |
| -2.481858196336065 | -7.961 | 5.549 | -0.012 |
| -2.475575011028886 | -7.903 | 5.457 | 0.076 |
| -2.469291825721706 | -7.844 | 5.364 | 0.162 |
| -2.463008640414527 | -7.785 | 5.272 | 0.247 |
| -2.456725455107347 | -7.726 | 5.181 | 0.33 |
| -2.450442269800167 | -7.667 | 5.09 | 0.411 |
| -2.444159084492988 | -7.608 | 4.999 | 0.492 |
| -2.437875899185808 | -7.549 | 4.909 | 0.571 |
| -2.431592713878628 | -7.49 | 4.819 | 0.648 |
| -2.425309528571449 | -7.431 | 4.73 | 0.724 |
| -2.419026343264269 | -7.372 | 4.642 | 0.798 |
| -2.412743157957089 | -7.314 | 4.554 | 0.871 |
| -2.40645997264991 | -7.255 | 4.466 | 0.942 |
| -2.40017678734273 | -7.196 | 4.38 | 1.012 |
| -2.393893602035551 | -7.137 | 4.293 | 1.08 |
| -2.387610416728371 | -7.079 | 4.208 | 1.147 |
| -2.381327231421191 | -7.02 | 4.123 | 1.212 |
| -2.375044046114012 | -6.962 | 4.038 | 1.275 |
| -2.368760860806832 | -6.904 | 3.954 | 1.337 |
| -2.362477675499652 | -6.845 | 3.871 | 1.398 |
| -2.356194490192473 | -6.787 | 3.789 | 1.457 |
| -2.349911304885293 | -6.729 | 3.707 | 1.514 |
| -2.343628119578113 | -6.671 | 3.626 | 1.57 |
| -2.337344934270934 | -6.613 | 3.545 | 1.624 |
| -2.331061748963754 | -6.556 | 3.465 | 1.677 |
| -2.324778563656574 | -6.498 | 3.386 | 1.728 |
| -2.318495378349395 | -6.441 | 3.308 | 1.777 |
| -2.312212193042215 | -6.383 | 3.23 | 1.825 |
| -2.305929007735036 | -6.326 | 3.153 | 1.872 |
| -2.299645822427856 | -6.269 | 3.077 | 1.917 |
| -2.293362637120676 | -6.212 | 3.001 | 1.96 |
| -2.287079451813496 | -6.155 | 2.926 | 2.002 |
| -2.280796266506317 | -6.099 | 2.852 | 2.042 |
| -2.274513081199137 | -6.042 | 2.779 | 2.081 |
| -2.268229895891957 | -5.986 | 2.706 | 2.118 |
| -2.261946710584778 | -5.93 | 2.635 | 2.154 |
| -2.255663525277598 | -5.874 | 2.564 | 2.188 |
| -2.249380339970419 | -5.818 | 2.493 | 2.221 |
| -2.24309715466324 | -5.762 | 2.424 | 2.253 |
| -2.23681396935606 | -5.707 | 2.355 | 2.282 |
| -2.23053078404888 | -5.652 | 2.287 | 2.311 |
| -2.2242475987417 | -5.597 | 2.22 | 2.338 |
| -2.217964413434521 | -5.542 | 2.154 | 2.363 |
| -2.211681228127341 | -5.487 | 2.088 | 2.387 |
| -2.205398042820161 | -5.433 | 2.023 | 2.41 |
| -2.199114857512981 | -5.379 | 1.959 | 2.432 |
| -2.192831672205802 | -5.325 | 1.896 | 2.451 |
| -2.186548486898622 | -5.271 | 1.834 | 2.47 |
| -2.180265301591443 | -5.218 | 1.772 | 2.487 |
| -2.173982116284263 | -5.164 | 1.712 | 2.503 |
| -2.167698930977084 | -5.111 | 1.652 | 2.518 |
| -2.161415745669904 | -5.059 | 1.593 | 2.531 |
| -2.155132560362724 | -5.006 | 1.534 | 2.543 |
| -2.148849375055545 | -4.954 | 1.477 | 2.554 |
| -2.142566189748365 | -4.902 | 1.42 | 2.564 |
| -2.136283004441185 | -4.85 | 1.364 | 2.572 |
| -2.129999819134006 | -4.798 | 1.309 | 2.579 |
| -2.123716633826826 | -4.747 | 1.255 | 2.585 |
| -2.117433448519646 | -4.696 | 1.202 | 2.589 |
| -2.111150263212467 | -4.645 | 1.149 | 2.593 |
| -2.104867077905287 | -4.594 | 1.097 | 2.595 |
| -2.098583892598107 | -4.544 | 1.046 | 2.597 |
| -2.092300707290928 | -4.494 | 0.996 | 2.597 |
| -2.086017521983748 | -4.444 | 0.947 | 2.596 |
| -2.079734336676569 | -4.395 | 0.899 | 2.594 |
| -2.073451151369389 | -4.345 | 0.851 | 2.591 |
| -2.06716796606221 | -4.297 | 0.804 | 2.587 |
| -2.06088478075503 | -4.248 | 0.758 | 2.582 |
| -2.05460159544785 | -4.2 | 0.713 | 2.576 |
| -2.04831841014067 | -4.151 | 0.668 | 2.569 |
| -2.042035224833491 | -4.104 | 0.624 | 2.561 |
| -2.035752039526311 | -4.056 | 0.582 | 2.552 |
| -2.029468854219131 | -4.009 | 0.539 | 2.543 |
| -2.023185668911951 | -3.962 | 0.498 | 2.532 |
| -2.016902483604772 | -3.915 | 0.458 | 2.52 |
| -2.010619298297592 | -3.869 | 0.418 | 2.508 |
| -2.004336112990412 | -3.823 | 0.379 | 2.495 |
| -1.998052927683233 | -3.777 | 0.341 | 2.481 |
| -1.991769742376054 | -3.732 | 0.303 | 2.467 |
| -1.985486557068874 | -3.686 | 0.267 | 2.451 |
| -1.979203371761694 | -3.642 | 0.231 | 2.435 |
| -1.972920186454515 | -3.597 | 0.196 | 2.418 |
| -1.966637001147335 | -3.553 | 0.161 | 2.401 |
| -1.960353815840155 | -3.509 | 0.128 | 2.382 |
| -1.954070630532976 | -3.465 | 0.095 | 2.364 |
| -1.947787445225796 | -3.422 | 0.063 | 2.344 |
| -1.941504259918616 | -3.379 | 0.031 | 2.324 |
| -1.935221074611437 | -3.336 | 0 | 2.303 |
| -1.928937889304257 | -3.294 | -0.029 | 2.282 |
| -1.922654703997078 | -3.252 | -0.059 | 2.26 |
| -1.916371518689898 | -3.21 | -0.087 | 2.238 |
| -1.910088333382718 | -3.168 | -0.115 | 2.215 |
| -1.903805148075539 | -3.127 | -0.142 | 2.192 |
| -1.897521962768359 | -3.087 | -0.169 | 2.168 |
| -1.891238777461179 | -3.046 | -0.194 | 2.144 |
| -1.884955592154 | -3.006 | -0.22 | 2.12 |
| -1.87867240684682 | -2.966 | -0.244 | 2.095 |
| -1.87238922153964 | -2.926 | -0.268 | 2.07 |
| -1.866106036232461 | -2.887 | -0.291 | 2.044 |
| -1.859822850925281 | -2.848 | -0.313 | 2.018 |
| -1.853539665618102 | -2.81 | -0.335 | 1.992 |
| -1.847256480310922 | -2.771 | -0.356 | 1.965 |
| -1.840973295003742 | -2.734 | -0.376 | 1.938 |
| -1.834690109696563 | -2.696 | -0.396 | 1.911 |
| -1.828406924389383 | -2.659 | -0.416 | 1.884 |
| -1.822123739082203 | -2.622 | -0.434 | 1.856 |
| -1.815840553775024 | -2.585 | -0.452 | 1.828 |
| -1.809557368467844 | -2.549 | -0.47 | 1.8 |
| -1.803274183160664 | -2.513 | -0.486 | 1.772 |
| -1.796990997853485 | -2.477 | -0.503 | 1.744 |
| -1.790707812546305 | -2.442 | -0.518 | 1.715 |
| -1.784424627239125 | -2.407 | -0.533 | 1.687 |
| -1.778141441931946 | -2.372 | -0.548 | 1.658 |
| -1.771858256624766 | -2.337 | -0.562 | 1.629 |
| -1.765575071317587 | -2.303 | -0.575 | 1.6 |
| -1.759291886010407 | -2.27 | -0.588 | 1.572 |
| -1.753008700703227 | -2.236 | -0.6 | 1.543 |
| -1.746725515396048 | -2.203 | -0.612 | 1.514 |
| -1.740442330088868 | -2.17 | -0.624 | 1.485 |
| -1.734159144781688 | -2.138 | -0.634 | 1.456 |
| -1.727875959474509 | -2.105 | -0.645 | 1.427 |
| -1.72159277416733 | -2.074 | -0.654 | 1.398 |
| -1.715309588860149 | -2.042 | -0.664 | 1.369 |
| -1.70902640355297 | -2.011 | -0.672 | 1.341 |
| -1.70274321824579 | -1.98 | -0.681 | 1.312 |
| -1.69646003293861 | -1.949 | -0.689 | 1.283 |
| -1.690176847631431 | -1.919 | -0.696 | 1.255 |
| -1.683893662324251 | -1.889 | -0.703 | 1.227 |
| -1.677610477017072 | -1.859 | -0.709 | 1.198 |
| -1.671327291709892 | -1.83 | -0.716 | 1.17 |
| -1.665044106402712 | -1.801 | -0.721 | 1.142 |
| -1.658760921095533 | -1.772 | -0.726 | 1.115 |
| -1.652477735788353 | -1.744 | -0.731 | 1.087 |
| -1.646194550481173 | -1.716 | -0.736 | 1.06 |
| -1.639911365173994 | -1.688 | -0.74 | 1.032 |
| -1.633628179866814 | -1.661 | -0.743 | 1.005 |
| -1.627344994559634 | -1.633 | -0.746 | 0.979 |
| -1.621061809252455 | -1.606 | -0.749 | 0.952 |
| -1.614778623945275 | -1.58 | -0.752 | 0.926 |
| -1.608495438638096 | -1.554 | -0.754 | 0.9 |
| -1.602212253330916 | -1.528 | -0.756 | 0.874 |
| -1.595929068023736 | -1.502 | -0.757 | 0.848 |
| -1.589645882716557 | -1.477 | -0.758 | 0.823 |
| -1.583362697409377 | -1.451 | -0.759 | 0.798 |
| -1.577079512102197 | -1.427 | -0.76 | 0.773 |
| -1.570796326795018 | -1.402 | -0.76 | 0.748 |
| -1.564513141487838 | -1.378 | -0.76 | 0.724 |
| -1.558229956180659 | -1.354 | -0.759 | 0.7 |
| -1.551946770873479 | -1.33 | -0.758 | 0.677 |
| -1.545663585566299 | -1.307 | -0.757 | 0.653 |
| -1.53938040025912 | -1.284 | -0.756 | 0.63 |
| -1.53309721495194 | -1.261 | -0.755 | 0.608 |
| -1.52681402964476 | -1.239 | -0.753 | 0.585 |
| -1.520530844337581 | -1.217 | -0.751 | 0.563 |
| -1.514247659030401 | -1.195 | -0.748 | 0.542 |
| -1.507964473723221 | -1.173 | -0.746 | 0.52 |
| -1.501681288416042 | -1.152 | -0.743 | 0.499 |
| -1.495398103108862 | -1.131 | -0.74 | 0.479 |
| -1.489114917801682 | -1.11 | -0.737 | 0.458 |
| -1.482831732494503 | -1.089 | -0.733 | 0.439 |
| -1.476548547187323 | -1.069 | -0.729 | 0.419 |
| -1.470265361880144 | -1.049 | -0.726 | 0.4 |
| -1.463982176572964 | -1.029 | -0.721 | 0.381 |
| -1.457698991265784 | -1.01 | -0.717 | 0.362 |
| -1.451415805958605 | -0.991 | -0.713 | 0.344 |
| -1.445132620651425 | -0.972 | -0.708 | 0.326 |
| -1.438849435344245 | -0.953 | -0.703 | 0.309 |
| -1.432566250037066 | -0.935 | -0.698 | 0.292 |
| -1.426283064729886 | -0.916 | -0.693 | 0.275 |
| -1.419999879422706 | -0.898 | -0.688 | 0.259 |
| -1.413716694115527 | -0.881 | -0.683 | 0.243 |
| -1.407433508808347 | -0.863 | -0.677 | 0.227 |
| -1.401150323501168 | -0.846 | -0.671 | 0.212 |
| -1.394867138193988 | -0.829 | -0.665 | 0.197 |
| -1.388583952886808 | -0.813 | -0.66 | 0.182 |
| -1.382300767579629 | -0.796 | -0.653 | 0.168 |
| -1.376017582272449 | -0.78 | -0.647 | 0.154 |
| -1.369734396965269 | -0.764 | -0.641 | 0.141 |
| -1.36345121165809 | -0.748 | -0.635 | 0.128 |
| -1.35716802635091 | -0.733 | -0.628 | 0.115 |
| -1.35088484104373 | -0.718 | -0.622 | 0.102 |
| -1.344601655736551 | -0.703 | -0.615 | 0.09 |
| -1.338318470429371 | -0.688 | -0.608 | 0.079 |
| -1.332035285122191 | -0.673 | -0.602 | 0.067 |
| -1.325752099815012 | -0.659 | -0.595 | 0.056 |
| -1.319468914507832 | -0.645 | -0.588 | 0.046 |
| -1.313185729200653 | -0.631 | -0.581 | 0.035 |
| -1.306902543893473 | -0.617 | -0.574 | 0.025 |
| -1.300619358586293 | -0.604 | -0.567 | 0.016 |
| -1.294336173279114 | -0.591 | -0.559 | 0.006 |
| -1.288052987971934 | -0.578 | -0.552 | -0.003 |
| -1.281769802664754 | -0.565 | -0.545 | -0.012 |
| -1.275486617357575 | -0.552 | -0.538 | -0.02 |
| -1.269203432050395 | -0.54 | -0.531 | -0.028 |
| -1.262920246743215 | -0.528 | -0.523 | -0.036 |
| -1.256637061436036 | -0.516 | -0.516 | -0.043 |
| -1.250353876128856 | -0.504 | -0.509 | -0.051 |
| -1.244070690821677 | -0.493 | -0.501 | -0.057 |
| -1.237787505514497 | -0.481 | -0.494 | -0.064 |
| -1.231504320207317 | -0.47 | -0.487 | -0.07 |
| -1.225221134900138 | -0.459 | -0.479 | -0.076 |
| -1.218937949592958 | -0.448 | -0.472 | -0.082 |
| -1.212654764285778 | -0.438 | -0.464 | -0.088 |
| -1.206371578978599 | -0.427 | -0.457 | -0.093 |
| -1.20008839367142 | -0.417 | -0.45 | -0.098 |
| -1.193805208364239 | -0.407 | -0.442 | -0.102 |
| -1.18752202305706 | -0.397 | -0.435 | -0.107 |
| -1.18123883774988 | -0.388 | -0.428 | -0.111 |
| -1.1749556524427 | -0.378 | -0.421 | -0.115 |
| -1.168672467135521 | -0.369 | -0.413 | -0.119 |
| -1.162389281828341 | -0.36 | -0.406 | -0.122 |
| -1.156106096521162 | -0.351 | -0.399 | -0.125 |
| -1.149822911213982 | -0.342 | -0.392 | -0.128 |
| -1.143539725906802 | -0.333 | -0.385 | -0.131 |
| -1.137256540599623 | -0.325 | -0.378 | -0.134 |
| -1.130973355292443 | -0.316 | -0.371 | -0.136 |
| -1.124690169985263 | -0.308 | -0.364 | -0.138 |
| -1.118406984678084 | -0.3 | -0.357 | -0.14 |
| -1.112123799370904 | -0.293 | -0.35 | -0.142 |
| -1.105840614063724 | -0.285 | -0.343 | -0.143 |
| -1.099557428756545 | -0.277 | -0.336 | -0.145 |
| -1.093274243449365 | -0.27 | -0.329 | -0.146 |
| -1.086991058142186 | -0.263 | -0.323 | -0.147 |
| -1.080707872835006 | -0.256 | -0.316 | -0.148 |
| -1.074424687527826 | -0.249 | -0.31 | -0.149 |
| -1.068141502220647 | -0.242 | -0.303 | -0.149 |
| -1.061858316913467 | -0.235 | -0.297 | -0.15 |
| -1.055575131606287 | -0.229 | -0.29 | -0.15 |
| -1.049291946299108 | -0.222 | -0.284 | -0.15 |
| -1.043008760991928 | -0.216 | -0.278 | -0.15 |
| -1.036725575684748 | -0.21 | -0.272 | -0.15 |
| -1.030442390377569 | -0.204 | -0.265 | -0.15 |
| -1.024159205070389 | -0.198 | -0.259 | -0.149 |
| -1.01787601976321 | -0.193 | -0.254 | -0.149 |
| -1.01159283445603 | -0.187 | -0.248 | -0.148 |
| -1.00530964914885 | -0.182 | -0.242 | -0.147 |
| -0.999026463841671 | -0.176 | -0.236 | -0.146 |
| -0.992743278534491 | -0.171 | -0.23 | -0.145 |
| -0.986460093227311 | -0.166 | -0.225 | -0.144 |
| -0.980176907920132 | -0.161 | -0.219 | -0.143 |
| -0.973893722612952 | -0.156 | -0.214 | -0.142 |
| -0.967610537305772 | -0.151 | -0.209 | -0.141 |
| -0.961327351998593 | -0.147 | -0.203 | -0.139 |
| -0.955044166691413 | -0.142 | -0.198 | -0.138 |
| -0.948760981384233 | -0.138 | -0.193 | -0.136 |
| -0.942477796077054 | -0.134 | -0.188 | -0.135 |
| -0.936194610769874 | -0.129 | -0.183 | -0.133 |
| -0.929911425462695 | -0.125 | -0.178 | -0.131 |
| -0.923628240155515 | -0.121 | -0.173 | -0.13 |
| -0.917345054848335 | -0.117 | -0.168 | -0.128 |
| -0.911061869541156 | -0.114 | -0.164 | -0.126 |
| -0.904778684233976 | -0.11 | -0.159 | -0.124 |
| -0.898495498926796 | -0.106 | -0.155 | -0.122 |
| -0.892212313619617 | -0.103 | -0.15 | -0.12 |
| -0.885929128312437 | -0.099 | -0.146 | -0.118 |
| -0.879645943005257 | -0.096 | -0.142 | -0.116 |
| -0.873362757698078 | -0.093 | -0.138 | -0.114 |
| -0.867079572390898 | -0.09 | -0.134 | -0.112 |
| -0.860796387083718 | -0.086 | -0.13 | -0.11 |
| -0.854513201776539 | -0.083 | -0.126 | -0.108 |
| -0.848230016469359 | -0.081 | -0.122 | -0.106 |
| -0.84194683116218 | -0.078 | -0.118 | -0.103 |
| -0.835663645855 | -0.075 | -0.114 | -0.101 |
| -0.82938046054782 | -0.072 | -0.111 | -0.099 |
| -0.823097275240641 | -0.07 | -0.107 | -0.097 |
| -0.816814089933461 | -0.067 | -0.104 | -0.095 |
| -0.810530904626281 | -0.065 | -0.1 | -0.092 |
| -0.804247719319102 | -0.062 | -0.097 | -0.09 |
| -0.797964534011922 | -0.06 | -0.094 | -0.088 |
| -0.791681348704742 | -0.058 | -0.091 | -0.086 |
| -0.785398163397563 | -0.055 | -0.088 | -0.084 |
| -0.779114978090383 | -0.053 | -0.085 | -0.082 |
| -0.772831792783204 | -0.051 | -0.082 | -0.08 |
| -0.766548607476024 | -0.049 | -0.079 | -0.077 |
| -0.760265422168844 | -0.047 | -0.076 | -0.075 |
| -0.753982236861665 | -0.046 | -0.073 | -0.073 |
| -0.747699051554485 | -0.044 | -0.071 | -0.071 |
| -0.741415866247305 | -0.042 | -0.068 | -0.069 |
| -0.735132680940126 | -0.04 | -0.066 | -0.067 |
| -0.728849495632946 | -0.039 | -0.063 | -0.065 |
| -0.722566310325766 | -0.037 | -0.061 | -0.063 |
| -0.716283125018587 | -0.035 | -0.058 | -0.061 |
| -0.709999939711407 | -0.034 | -0.056 | -0.059 |
| -0.703716754404227 | -0.033 | -0.054 | -0.057 |
| -0.697433569097048 | -0.031 | -0.052 | -0.055 |
| -0.691150383789868 | -0.03 | -0.05 | -0.054 |
| -0.684867198482689 | -0.028 | -0.048 | -0.052 |
| -0.678584013175509 | -0.027 | -0.046 | -0.05 |
| -0.672300827868329 | -0.026 | -0.044 | -0.048 |
| -0.66601764256115 | -0.025 | -0.042 | -0.047 |
| -0.65973445725397 | -0.024 | -0.04 | -0.045 |
| -0.65345127194679 | -0.023 | -0.039 | -0.043 |
| -0.647168086639611 | -0.022 | -0.037 | -0.042 |
| -0.640884901332431 | -0.021 | -0.035 | -0.04 |
| -0.634601716025251 | -0.02 | -0.034 | -0.039 |
| -0.628318530718072 | -0.019 | -0.032 | -0.037 |
| -0.622035345410892 | -0.018 | -0.031 | -0.036 |
| -0.615752160103712 | -0.017 | -0.029 | -0.034 |
| -0.609468974796533 | -0.016 | -0.028 | -0.033 |
| -0.603185789489353 | -0.015 | -0.027 | -0.031 |
| -0.596902604182174 | -0.015 | -0.025 | -0.03 |
| -0.590619418874994 | -0.014 | -0.024 | -0.029 |
| -0.584336233567814 | -0.013 | -0.023 | -0.028 |
| -0.578053048260635 | -0.012 | -0.022 | -0.026 |
| -0.571769862953455 | -0.012 | -0.021 | -0.025 |
| -0.565486677646275 | -0.011 | -0.02 | -0.024 |
| -0.559203492339096 | -0.011 | -0.019 | -0.023 |
| -0.552920307031916 | -0.01 | -0.018 | -0.022 |
| -0.546637121724737 | -0.009 | -0.017 | -0.021 |
| -0.540353936417557 | -0.009 | -0.016 | -0.02 |
| -0.534070751110377 | -0.008 | -0.015 | -0.019 |
| -0.527787565803198 | -0.008 | -0.014 | -0.018 |
| -0.521504380496018 | -0.007 | -0.014 | -0.017 |
| -0.515221195188838 | -0.007 | -0.013 | -0.016 |
| -0.508938009881659 | -0.007 | -0.012 | -0.015 |
| -0.502654824574479 | -0.006 | -0.011 | -0.014 |
| -0.496371639267299 | -0.006 | -0.011 | -0.014 |
| -0.49008845396012 | -0.005 | -0.01 | -0.013 |
| -0.48380526865294 | -0.005 | -0.009 | -0.012 |
| -0.477522083345761 | -0.005 | -0.009 | -0.012 |
| -0.471238898038581 | -0.005 | -0.008 | -0.011 |
| -0.464955712731402 | -0.004 | -0.008 | -0.01 |
| -0.458672527424222 | -0.004 | -0.007 | -0.01 |
| -0.452389342117042 | -0.004 | -0.007 | -0.009 |
| -0.446106156809863 | -0.003 | -0.006 | -0.008 |
| -0.439822971502683 | -0.003 | -0.006 | -0.008 |
| -0.433539786195504 | -0.003 | -0.006 | -0.007 |
| -0.427256600888324 | -0.003 | -0.005 | -0.007 |
| -0.420973415581144 | -0.003 | -0.005 | -0.007 |
| -0.414690230273965 | -0.002 | -0.005 | -0.006 |
| -0.408407044966785 | -0.002 | -0.004 | -0.006 |
| -0.402123859659606 | -0.002 | -0.004 | -0.005 |
| -0.395840674352426 | -0.002 | -0.004 | -0.005 |
| -0.389557489045247 | -0.002 | -0.003 | -0.005 |
| -0.383274303738067 | -0.002 | -0.003 | -0.004 |
| -0.376991118430887 | -0.001 | -0.003 | -0.004 |
| -0.370707933123708 | -0.001 | -0.003 | -0.004 |
| -0.364424747816528 | -0.001 | -0.002 | -0.003 |
| -0.358141562509349 | -0.001 | -0.002 | -0.003 |
| -0.351858377202169 | -0.001 | -0.002 | -0.003 |
| -0.345575191894989 | -0.001 | -0.002 | -0.003 |
| -0.33929200658781 | -0.001 | -0.002 | -0.002 |
| -0.33300882128063 | -0.001 | -0.002 | -0.002 |
| -0.326725635973451 | -0.001 | -0.001 | -0.002 |
| -0.320442450666271 | -0.001 | -0.001 | -0.002 |
| -0.314159265359092 | -0.001 | -0.001 | -0.002 |
| -0.307876080051912 | -0.001 | -0.001 | -0.001 |
| -0.301592894744732 | 0 | -0.001 | -0.001 |
| -0.295309709437553 | 0 | -0.001 | -0.001 |
| -0.289026524130373 | 0 | -0.001 | -0.001 |
| -0.282743338823194 | 0 | -0.001 | -0.001 |
| -0.276460153516014 | 0 | -0.001 | -0.001 |
| -0.270176968208834 | 0 | -0.001 | -0.001 |
| -0.263893782901655 | 0 | 0 | -0.001 |
| -0.257610597594475 | 0 | 0 | -0.001 |
| -0.251327412287296 | 0 | 0 | -0.001 |
| -0.245044226980116 | 0 | 0 | 0 |
| -0.238761041672937 | 0 | 0 | 0 |
| -0.232477856365757 | 0 | 0 | 0 |
| -0.226194671058577 | 0 | 0 | 0 |
| -0.219911485751398 | 0 | 0 | 0 |
| -0.213628300444218 | 0 | 0 | 0 |
| -0.207345115137039 | 0 | 0 | 0 |
| -0.201061929829859 | 0 | 0 | 0 |
| -0.194778744522679 | 0 | 0 | 0 |
| -0.1884955592155 | 0 | 0 | 0 |
| -0.18221237390832 | 0 | 0 | 0 |
| -0.175929188601141 | 0 | 0 | 0 |
| -0.169646003293961 | 0 | 0 | 0 |
| -0.163362817986782 | 0 | 0 | 0 |
| -0.157079632679602 | 0 | 0 | 0 |
| -0.150796447372422 | 0 | 0 | 0 |
| -0.144513262065243 | 0 | 0 | 0 |
| -0.138230076758063 | 0 | 0 | 0 |
| -0.131946891450884 | 0 | 0 | 0 |
| -0.125663706143704 | 0 | 0 | 0 |
| -0.119380520836524 | 0 | 0 | 0 |
| -0.113097335529345 | 0 | 0 | 0 |
| -0.106814150222165 | 0 | 0 | 0 |
| -0.100530964914986 | 0 | 0 | 0 |
| -0.0942477796078061 | 0 | 0 | 0 |
| -0.0879645943006265 | 0 | 0 | 0 |
| -0.0816814089934469 | 0 | 0 | 0 |
| -0.0753982236862674 | 0 | 0 | 0 |
| -0.0691150383790878 | 0 | 0 | 0 |
| -0.0628318530719082 | 0 | 0 | 0 |
| -0.0565486677647286 | 0 | 0 | 0 |
| -0.050265482457549 | 0 | 0 | 0 |
| -0.0439822971503694 | 0 | 0 | 0 |
| -0.0376991118431899 | 0 | 0 | 0 |
| -0.0314159265360103 | 0 | 0 | 0 |
| -0.0251327412288307 | 0 | 0 | 0 |
| -0.0188495559216511 | 0 | 0 | 0 |
| -0.0125663706144715 | 0 | 0 | 0 |
| -0.00628318530729192 | 0 | 0 | 0 |
| -1.12338957580782e-13 | 0 | 0 | 0 |
| 0.00628318530706725 | 0 | 0 | 0 |
| 0.0125663706142468 | 0 | 0 | 0 |
| 0.0188495559214264 | 0 | 0 | 0 |
| 0.025132741228606 | 0 | 0 | 0 |
| 0.0314159265357856 | 0 | 0 | 0 |
| 0.0376991118429652 | 0 | 0 | 0 |
| 0.0439822971501448 | 0 | 0 | 0 |
| 0.0502654824573243 | 0 | 0 | 0 |
| 0.0565486677645039 | 0 | 0 | 0 |
| 0.0628318530716835 | 0 | 0 | 0 |
| 0.0691150383788631 | 0 | 0 | 0 |
| 0.0753982236860427 | 0 | 0 | 0 |
| 0.0816814089932222 | 0 | 0 | 0 |
| 0.0879645943004018 | 0 | 0 | 0 |
| 0.0942477796075814 | 0 | 0 | 0 |
| 0.100530964914761 | 0 | 0 | 0 |
| 0.106814150221941 | 0 | 0 | 0 |
| 0.11309733552912 | 0 | 0 | 0 |
| 0.1193805208363 | 0 | 0 | 0 |
| 0.125663706143479 | 0 | 0 | 0 |
| 0.131946891450659 | 0 | 0 | 0 |
| 0.138230076757839 | 0 | 0 | 0 |
| 0.144513262065018 | 0 | 0 | 0 |
| 0.150796447372198 | 0 | 0 | 0 |
| 0.157079632679377 | 0 | 0 | 0 |
| 0.163362817986557 | 0 | 0 | 0 |
| 0.169646003293736 | 0 | 0 | 0 |
| 0.175929188600916 | 0 | 0 | 0 |
| 0.182212373908096 | 0 | 0 | 0 |
| 0.188495559215275 | 0 | 0 | 0 |
| 0.194778744522455 | 0 | 0 | 0 |
| 0.201061929829634 | 0 | 0 | 0 |
| 0.207345115136814 | 0 | 0 | 0 |
| 0.213628300443994 | 0 | 0 | 0 |
| 0.219911485751173 | 0 | 0 | 0 |
| 0.226194671058353 | 0 | 0 | 0 |
| 0.232477856365532 | 0 | 0 | 0 |
| 0.238761041672712 | 0 | 0 | 0 |
| 0.245044226979891 | 0 | 0 | 0 |
| 0.251327412287071 | 0 | 0 | 0.001 |
| 0.257610597594251 | 0 | 0 | 0.001 |
| 0.26389378290143 | 0 | 0 | 0.001 |
| 0.27017696820861 | 0 | 0.001 | 0.001 |
| 0.276460153515789 | 0 | 0.001 | 0.001 |
| 0.282743338822969 | 0 | 0.001 | 0.001 |
| 0.289026524130149 | 0 | 0.001 | 0.001 |
| 0.295309709437328 | 0 | 0.001 | 0.001 |
| 0.301592894744508 | 0 | 0.001 | 0.001 |
| 0.307876080051687 | 0.001 | 0.001 | 0.001 |
| 0.314159265358867 | 0.001 | 0.001 | 0.002 |
| 0.320442450666046 | 0.001 | 0.001 | 0.002 |
| 0.326725635973226 | 0.001 | 0.001 | 0.002 |
| 0.333008821280406 | 0.001 | 0.002 | 0.002 |
| 0.339292006587585 | 0.001 | 0.002 | 0.002 |
| 0.345575191894765 | 0.001 | 0.002 | 0.003 |
| 0.351858377201944 | 0.001 | 0.002 | 0.003 |
| 0.358141562509124 | 0.001 | 0.002 | 0.003 |
| 0.364424747816304 | 0.001 | 0.002 | 0.003 |
| 0.370707933123483 | 0.001 | 0.003 | 0.004 |
| 0.376991118430663 | 0.001 | 0.003 | 0.004 |
| 0.383274303737842 | 0.002 | 0.003 | 0.004 |
| 0.389557489045022 | 0.002 | 0.003 | 0.005 |
| 0.395840674352201 | 0.002 | 0.004 | 0.005 |
| 0.402123859659381 | 0.002 | 0.004 | 0.005 |
| 0.408407044966561 | 0.002 | 0.004 | 0.006 |
| 0.41469023027374 | 0.002 | 0.005 | 0.006 |
| 0.42097341558092 | 0.003 | 0.005 | 0.007 |
| 0.427256600888099 | 0.003 | 0.005 | 0.007 |
| 0.433539786195279 | 0.003 | 0.006 | 0.007 |
| 0.439822971502459 | 0.003 | 0.006 | 0.008 |
| 0.446106156809638 | 0.003 | 0.006 | 0.008 |
| 0.452389342116818 | 0.004 | 0.007 | 0.009 |
| 0.458672527423997 | 0.004 | 0.007 | 0.01 |
| 0.464955712731177 | 0.004 | 0.008 | 0.01 |
| 0.471238898038356 | 0.005 | 0.008 | 0.011 |
| 0.477522083345536 | 0.005 | 0.009 | 0.012 |
| 0.483805268652716 | 0.005 | 0.009 | 0.012 |
| 0.490088453959895 | 0.005 | 0.01 | 0.013 |
| 0.496371639267075 | 0.006 | 0.011 | 0.014 |
| 0.502654824574254 | 0.006 | 0.011 | 0.014 |
| 0.508938009881434 | 0.007 | 0.012 | 0.015 |
| 0.515221195188614 | 0.007 | 0.013 | 0.016 |
| 0.521504380495793 | 0.007 | 0.014 | 0.017 |
| 0.527787565802973 | 0.008 | 0.014 | 0.018 |
| 0.534070751110153 | 0.008 | 0.015 | 0.019 |
| 0.540353936417332 | 0.009 | 0.016 | 0.02 |
| 0.546637121724512 | 0.009 | 0.017 | 0.021 |
| 0.552920307031692 | 0.01 | 0.018 | 0.022 |
| 0.559203492338871 | 0.011 | 0.019 | 0.023 |
| 0.565486677646051 | 0.011 | 0.02 | 0.024 |
| 0.571769862953231 | 0.012 | 0.021 | 0.025 |
| 0.57805304826041 | 0.012 | 0.022 | 0.026 |
| 0.58433623356759 | 0.013 | 0.023 | 0.028 |
| 0.590619418874769 | 0.014 | 0.024 | 0.029 |
| 0.596902604181949 | 0.015 | 0.025 | 0.03 |
| 0.603185789489129 | 0.015 | 0.027 | 0.031 |
| 0.609468974796308 | 0.016 | 0.028 | 0.033 |
| 0.615752160103488 | 0.017 | 0.029 | 0.034 |
| 0.622035345410668 | 0.018 | 0.031 | 0.036 |
| 0.628318530717847 | 0.019 | 0.032 | 0.037 |
| 0.634601716025027 | 0.02 | 0.034 | 0.039 |
| 0.640884901332206 | 0.021 | 0.035 | 0.04 |
| 0.647168086639386 | 0.022 | 0.037 | 0.042 |
| 0.653451271946566 | 0.023 | 0.039 | 0.043 |
| 0.659734457253745 | 0.024 | 0.04 | 0.045 |
| 0.666017642560925 | 0.025 | 0.042 | 0.047 |
| 0.672300827868105 | 0.026 | 0.044 | 0.048 |
| 0.678584013175284 | 0.027 | 0.046 | 0.05 |
| 0.684867198482464 | 0.028 | 0.048 | 0.052 |
| 0.691150383789644 | 0.03 | 0.05 | 0.054 |
| 0.697433569096823 | 0.031 | 0.052 | 0.055 |
| 0.703716754404003 | 0.033 | 0.054 | 0.057 |
| 0.709999939711183 | 0.034 | 0.056 | 0.059 |
| 0.716283125018362 | 0.035 | 0.058 | 0.061 |
| 0.722566310325542 | 0.037 | 0.061 | 0.063 |
| 0.728849495632721 | 0.039 | 0.063 | 0.065 |
| 0.735132680939901 | 0.04 | 0.066 | 0.067 |
| 0.741415866247081 | 0.042 | 0.068 | 0.069 |
| 0.74769905155426 | 0.044 | 0.071 | 0.071 |
| 0.75398223686144 | 0.046 | 0.073 | 0.073 |
| 0.76026542216862 | 0.047 | 0.076 | 0.075 |
| 0.766548607475799 | 0.049 | 0.079 | 0.077 |
| 0.772831792782979 | 0.051 | 0.082 | 0.08 |
| 0.779114978090159 | 0.053 | 0.085 | 0.082 |
| 0.785398163397338 | 0.055 | 0.088 | 0.084 |
| 0.791681348704518 | 0.058 | 0.091 | 0.086 |
| 0.797964534011697 | 0.06 | 0.094 | 0.088 |
| 0.804247719318877 | 0.062 | 0.097 | 0.09 |
| 0.810530904626057 | 0.065 | 0.1 | 0.092 |
| 0.816814089933236 | 0.067 | 0.104 | 0.095 |
| 0.823097275240416 | 0.07 | 0.107 | 0.097 |
| 0.829380460547596 | 0.072 | 0.111 | 0.099 |
| 0.835663645854775 | 0.075 | 0.114 | 0.101 |
| 0.841946831161955 | 0.078 | 0.118 | 0.103 |
| 0.848230016469135 | 0.081 | 0.122 | 0.106 |
| 0.854513201776314 | 0.083 | 0.126 | 0.108 |
| 0.860796387083494 | 0.086 | 0.13 | 0.11 |
| 0.867079572390674 | 0.09 | 0.134 | 0.112 |
| 0.873362757697853 | 0.093 | 0.138 | 0.114 |
| 0.879645943005033 | 0.096 | 0.142 | 0.116 |
| 0.885929128312212 | 0.099 | 0.146 | 0.118 |
| 0.892212313619392 | 0.103 | 0.15 | 0.12 |
| 0.898495498926572 | 0.106 | 0.155 | 0.122 |
| 0.904778684233751 | 0.11 | 0.159 | 0.124 |
| 0.911061869540931 | 0.114 | 0.164 | 0.126 |
| 0.917345054848111 | 0.117 | 0.168 | 0.128 |
| 0.92362824015529 | 0.121 | 0.173 | 0.13 |
| 0.92991142546247 | 0.125 | 0.178 | 0.131 |
| 0.93619461076965 | 0.129 | 0.183 | 0.133 |
| 0.942477796076829 | 0.134 | 0.188 | 0.135 |
| 0.948760981384009 | 0.138 | 0.193 | 0.136 |
| 0.955044166691188 | 0.142 | 0.198 | 0.138 |
| 0.961327351998368 | 0.147 | 0.203 | 0.139 |
| 0.967610537305548 | 0.151 | 0.209 | 0.141 |
| 0.973893722612727 | 0.156 | 0.214 | 0.142 |
| 0.980176907919907 | 0.161 | 0.219 | 0.143 |
| 0.986460093227087 | 0.166 | 0.225 | 0.144 |
| 0.992743278534266 | 0.171 | 0.23 | 0.145 |
| 0.999026463841446 | 0.176 | 0.236 | 0.146 |
| 1.005309649148626 | 0.182 | 0.242 | 0.147 |
| 1.011592834455805 | 0.187 | 0.248 | 0.148 |
| 1.017876019762985 | 0.193 | 0.254 | 0.149 |
| 1.024159205070164 | 0.198 | 0.259 | 0.149 |
| 1.030442390377344 | 0.204 | 0.265 | 0.15 |
| 1.036725575684524 | 0.21 | 0.272 | 0.15 |
| 1.043008760991703 | 0.216 | 0.278 | 0.15 |
| 1.049291946298883 | 0.222 | 0.284 | 0.15 |
| 1.055575131606063 | 0.229 | 0.29 | 0.15 |
| 1.061858316913242 | 0.235 | 0.297 | 0.15 |
| 1.068141502220422 | 0.242 | 0.303 | 0.149 |
| 1.074424687527602 | 0.249 | 0.31 | 0.149 |
| 1.080707872834781 | 0.256 | 0.316 | 0.148 |
| 1.086991058141961 | 0.263 | 0.323 | 0.147 |
| 1.09327424344914 | 0.27 | 0.329 | 0.146 |
| 1.09955742875632 | 0.277 | 0.336 | 0.145 |
| 1.1058406140635 | 0.285 | 0.343 | 0.143 |
| 1.112123799370679 | 0.293 | 0.35 | 0.142 |
| 1.11840698467786 | 0.3 | 0.357 | 0.14 |
| 1.124690169985039 | 0.308 | 0.364 | 0.138 |
| 1.130973355292218 | 0.316 | 0.371 | 0.136 |
| 1.137256540599398 | 0.325 | 0.378 | 0.134 |
| 1.143539725906578 | 0.333 | 0.385 | 0.131 |
| 1.149822911213757 | 0.342 | 0.392 | 0.128 |
| 1.156106096520937 | 0.351 | 0.399 | 0.125 |
| 1.162389281828116 | 0.36 | 0.406 | 0.122 |
| 1.168672467135296 | 0.369 | 0.413 | 0.119 |
| 1.174955652442476 | 0.378 | 0.421 | 0.115 |
| 1.181238837749655 | 0.388 | 0.428 | 0.111 |
| 1.187522023056835 | 0.397 | 0.435 | 0.107 |
| 1.193805208364015 | 0.407 | 0.442 | 0.102 |
| 1.200088393671194 | 0.417 | 0.45 | 0.098 |
| 1.206371578978374 | 0.427 | 0.457 | 0.093 |
| 1.212654764285554 | 0.438 | 0.464 | 0.088 |
| 1.218937949592733 | 0.448 | 0.472 | 0.082 |
| 1.225221134899913 | 0.459 | 0.479 | 0.076 |
| 1.231504320207093 | 0.47 | 0.487 | 0.07 |
| 1.237787505514272 | 0.481 | 0.494 | 0.064 |
| 1.244070690821452 | 0.493 | 0.501 | 0.057 |
| 1.250353876128631 | 0.504 | 0.509 | 0.051 |
| 1.256637061435811 | 0.516 | 0.516 | 0.043 |
| 1.262920246742991 | 0.528 | 0.523 | 0.036 |
| 1.26920343205017 | 0.54 | 0.531 | 0.028 |
| 1.27548661735735 | 0.552 | 0.538 | 0.02 |
| 1.28176980266453 | 0.565 | 0.545 | 0.012 |
| 1.28805298797171 | 0.578 | 0.552 | 0.003 |
| 1.294336173278889 | 0.591 | 0.559 | -0.006 |
| 1.300619358586069 | 0.604 | 0.567 | -0.016 |
| 1.306902543893248 | 0.617 | 0.574 | -0.025 |
| 1.313185729200428 | 0.631 | 0.581 | -0.035 |
| 1.319468914507607 | 0.645 | 0.588 | -0.046 |
| 1.325752099814787 | 0.659 | 0.595 | -0.056 |
| 1.332035285121967 | 0.673 | 0.602 | -0.067 |
| 1.338318470429146 | 0.688 | 0.608 | -0.079 |
| 1.344601655736326 | 0.703 | 0.615 | -0.09 |
| 1.350884841043506 | 0.718 | 0.622 | -0.102 |
| 1.357168026350685 | 0.733 | 0.628 | -0.115 |
| 1.363451211657865 | 0.748 | 0.635 | -0.128 |
| 1.369734396965045 | 0.764 | 0.641 | -0.141 |
| 1.376017582272224 | 0.78 | 0.647 | -0.154 |
| 1.382300767579404 | 0.796 | 0.653 | -0.168 |
| 1.388583952886583 | 0.813 | 0.66 | -0.182 |
| 1.394867138193763 | 0.829 | 0.665 | -0.197 |
| 1.401150323500943 | 0.846 | 0.671 | -0.212 |
| 1.407433508808122 | 0.863 | 0.677 | -0.227 |
| 1.413716694115302 | 0.881 | 0.683 | -0.243 |
| 1.419999879422482 | 0.898 | 0.688 | -0.259 |
| 1.426283064729661 | 0.916 | 0.693 | -0.275 |
| 1.432566250036841 | 0.935 | 0.698 | -0.292 |
| 1.438849435344021 | 0.953 | 0.703 | -0.309 |
| 1.4451326206512 | 0.972 | 0.708 | -0.326 |
| 1.45141580595838 | 0.991 | 0.713 | -0.344 |
| 1.45769899126556 | 1.01 | 0.717 | -0.362 |
| 1.46398217657274 | 1.029 | 0.721 | -0.381 |
| 1.470265361879919 | 1.049 | 0.726 | -0.4 |
| 1.476548547187098 | 1.069 | 0.729 | -0.419 |
| 1.482831732494278 | 1.089 | 0.733 | -0.439 |
| 1.489114917801458 | 1.11 | 0.737 | -0.458 |
| 1.495398103108637 | 1.131 | 0.74 | -0.479 |
| 1.501681288415817 | 1.152 | 0.743 | -0.499 |
| 1.507964473722997 | 1.173 | 0.746 | -0.52 |
| 1.514247659030176 | 1.195 | 0.748 | -0.542 |
| 1.520530844337356 | 1.217 | 0.751 | -0.563 |
| 1.526814029644536 | 1.239 | 0.753 | -0.585 |
| 1.533097214951715 | 1.261 | 0.755 | -0.608 |
| 1.539380400258895 | 1.284 | 0.756 | -0.63 |
| 1.545663585566075 | 1.307 | 0.757 | -0.653 |
| 1.551946770873254 | 1.33 | 0.758 | -0.677 |
| 1.558229956180434 | 1.354 | 0.759 | -0.7 |
| 1.564513141487613 | 1.378 | 0.76 | -0.724 |
| 1.570796326794793 | 1.402 | 0.76 | -0.748 |
| 1.577079512101973 | 1.427 | 0.76 | -0.773 |
| 1.583362697409152 | 1.451 | 0.759 | -0.798 |
| 1.589645882716332 | 1.477 | 0.758 | -0.823 |
| 1.595929068023512 | 1.502 | 0.757 | -0.848 |
| 1.602212253330691 | 1.528 | 0.756 | -0.874 |
| 1.608495438637871 | 1.554 | 0.754 | -0.9 |
| 1.61477862394505 | 1.58 | 0.752 | -0.926 |
| 1.62106180925223 | 1.606 | 0.749 | -0.952 |
| 1.62734499455941 | 1.633 | 0.746 | -0.979 |
| 1.633628179866589 | 1.661 | 0.743 | -1.005 |
| 1.63991136517377 | 1.688 | 0.74 | -1.032 |
| 1.646194550480949 | 1.716 | 0.736 | -1.06 |
| 1.652477735788128 | 1.744 | 0.731 | -1.087 |
| 1.658760921095308 | 1.772 | 0.726 | -1.115 |
| 1.665044106402488 | 1.801 | 0.721 | -1.142 |
| 1.671327291709667 | 1.83 | 0.716 | -1.17 |
| 1.677610477016847 | 1.859 | 0.709 | -1.198 |
| 1.683893662324026 | 1.889 | 0.703 | -1.227 |
| 1.690176847631206 | 1.919 | 0.696 | -1.255 |
| 1.696460032938386 | 1.949 | 0.689 | -1.283 |
| 1.702743218245565 | 1.98 | 0.681 | -1.312 |
| 1.709026403552745 | 2.011 | 0.672 | -1.341 |
| 1.715309588859925 | 2.042 | 0.664 | -1.369 |
| 1.721592774167104 | 2.074 | 0.654 | -1.398 |
| 1.727875959474284 | 2.105 | 0.645 | -1.427 |
| 1.734159144781464 | 2.138 | 0.634 | -1.456 |
| 1.740442330088643 | 2.17 | 0.624 | -1.485 |
| 1.746725515395823 | 2.203 | 0.612 | -1.514 |
| 1.753008700703003 | 2.236 | 0.6 | -1.543 |
| 1.759291886010182 | 2.27 | 0.588 | -1.572 |
| 1.765575071317362 | 2.303 | 0.575 | -1.6 |
| 1.771858256624541 | 2.337 | 0.562 | -1.629 |
| 1.778141441931721 | 2.372 | 0.548 | -1.658 |
| 1.784424627238901 | 2.407 | 0.533 | -1.687 |
| 1.79070781254608 | 2.442 | 0.518 | -1.715 |
| 1.79699099785326 | 2.477 | 0.503 | -1.744 |
| 1.80327418316044 | 2.513 | 0.486 | -1.772 |
| 1.809557368467619 | 2.549 | 0.47 | -1.8 |
| 1.815840553774799 | 2.585 | 0.452 | -1.828 |
| 1.822123739081979 | 2.622 | 0.434 | -1.856 |
| 1.828406924389158 | 2.659 | 0.416 | -1.884 |
| 1.834690109696338 | 2.696 | 0.396 | -1.911 |
| 1.840973295003518 | 2.734 | 0.376 | -1.938 |
| 1.847256480310697 | 2.771 | 0.356 | -1.965 |
| 1.853539665617877 | 2.81 | 0.335 | -1.992 |
| 1.859822850925056 | 2.848 | 0.313 | -2.018 |
| 1.866106036232236 | 2.887 | 0.291 | -2.044 |
| 1.872389221539416 | 2.926 | 0.268 | -2.07 |
| 1.878672406846595 | 2.966 | 0.244 | -2.095 |
| 1.884955592153775 | 3.006 | 0.22 | -2.12 |
| 1.891238777460955 | 3.046 | 0.194 | -2.144 |
| 1.897521962768134 | 3.087 | 0.169 | -2.168 |
| 1.903805148075314 | 3.127 | 0.142 | -2.192 |
| 1.910088333382494 | 3.168 | 0.115 | -2.215 |
| 1.916371518689673 | 3.21 | 0.087 | -2.238 |
| 1.922654703996853 | 3.252 | 0.059 | -2.26 |
| 1.928937889304033 | 3.294 | 0.029 | -2.282 |
| 1.935221074611212 | 3.336 | 0 | -2.303 |
| 1.941504259918392 | 3.379 | -0.031 | -2.324 |
| 1.947787445225571 | 3.422 | -0.063 | -2.344 |
| 1.954070630532751 | 3.465 | -0.095 | -2.364 |
| 1.960353815839931 | 3.509 | -0.128 | -2.382 |
| 1.96663700114711 | 3.553 | -0.161 | -2.401 |
| 1.97292018645429 | 3.597 | -0.196 | -2.418 |
| 1.97920337176147 | 3.642 | -0.231 | -2.435 |
| 1.985486557068649 | 3.686 | -0.267 | -2.451 |
| 1.991769742375829 | 3.732 | -0.303 | -2.467 |
| 1.998052927683009 | 3.777 | -0.341 | -2.481 |
| 2.004336112990188 | 3.823 | -0.379 | -2.495 |
| 2.010619298297368 | 3.869 | -0.418 | -2.508 |
| 2.016902483604547 | 3.915 | -0.458 | -2.52 |
| 2.023185668911727 | 3.962 | -0.498 | -2.532 |
| 2.029468854218907 | 4.009 | -0.539 | -2.543 |
| 2.035752039526086 | 4.056 | -0.582 | -2.552 |
| 2.042035224833266 | 4.104 | -0.624 | -2.561 |
| 2.048318410140446 | 4.151 | -0.668 | -2.569 |
| 2.054601595447625 | 4.2 | -0.713 | -2.576 |
| 2.060884780754805 | 4.248 | -0.758 | -2.582 |
| 2.067167966061984 | 4.297 | -0.804 | -2.587 |
| 2.073451151369164 | 4.345 | -0.851 | -2.591 |
| 2.079734336676344 | 4.395 | -0.899 | -2.594 |
| 2.086017521983524 | 4.444 | -0.947 | -2.596 |
| 2.092300707290703 | 4.494 | -0.996 | -2.597 |
| 2.098583892597883 | 4.544 | -1.046 | -2.597 |
| 2.104867077905062 | 4.594 | -1.097 | -2.595 |
| 2.111150263212242 | 4.645 | -1.149 | -2.593 |
| 2.117433448519422 | 4.696 | -1.202 | -2.589 |
| 2.123716633826601 | 4.747 | -1.255 | -2.585 |
| 2.129999819133781 | 4.798 | -1.309 | -2.579 |
| 2.136283004440961 | 4.85 | -1.364 | -2.572 |
| 2.14256618974814 | 4.902 | -1.42 | -2.564 |
| 2.14884937505532 | 4.954 | -1.477 | -2.554 |
| 2.1551325603625 | 5.006 | -1.534 | -2.543 |
| 2.16141574566968 | 5.059 | -1.593 | -2.531 |
| 2.167698930976859 | 5.111 | -1.652 | -2.518 |
| 2.173982116284038 | 5.164 | -1.712 | -2.503 |
| 2.180265301591218 | 5.218 | -1.772 | -2.487 |
| 2.186548486898398 | 5.271 | -1.834 | -2.47 |
| 2.192831672205577 | 5.325 | -1.896 | -2.451 |
| 2.199114857512757 | 5.379 | -1.959 | -2.432 |
| 2.205398042819936 | 5.433 | -2.023 | -2.41 |
| 2.211681228127116 | 5.487 | -2.088 | -2.387 |
| 2.217964413434296 | 5.542 | -2.154 | -2.363 |
| 2.224247598741475 | 5.597 | -2.22 | -2.338 |
| 2.230530784048655 | 5.652 | -2.287 | -2.311 |
| 2.236813969355835 | 5.707 | -2.355 | -2.282 |
| 2.243097154663014 | 5.762 | -2.424 | -2.253 |
| 2.249380339970194 | 5.818 | -2.493 | -2.221 |
| 2.255663525277374 | 5.874 | -2.564 | -2.188 |
| 2.261946710584553 | 5.93 | -2.635 | -2.154 |
| 2.268229895891733 | 5.986 | -2.706 | -2.118 |
| 2.274513081198912 | 6.042 | -2.779 | -2.081 |
| 2.280796266506092 | 6.099 | -2.852 | -2.042 |
| 2.287079451813272 | 6.155 | -2.926 | -2.002 |
| 2.293362637120452 | 6.212 | -3.001 | -1.96 |
| 2.299645822427631 | 6.269 | -3.077 | -1.917 |
| 2.305929007734811 | 6.326 | -3.153 | -1.872 |
| 2.312212193041991 | 6.383 | -3.23 | -1.825 |
| 2.31849537834917 | 6.441 | -3.308 | -1.777 |
| 2.32477856365635 | 6.498 | -3.386 | -1.728 |
| 2.331061748963529 | 6.556 | -3.465 | -1.677 |
| 2.337344934270709 | 6.613 | -3.545 | -1.624 |
| 2.343628119577889 | 6.671 | -3.626 | -1.57 |
| 2.349911304885068 | 6.729 | -3.707 | -1.514 |
| 2.356194490192248 | 6.787 | -3.789 | -1.457 |
| 2.362477675499428 | 6.845 | -3.871 | -1.398 |
| 2.368760860806607 | 6.904 | -3.954 | -1.337 |
| 2.375044046113787 | 6.962 | -4.038 | -1.275 |
| 2.381327231420966 | 7.02 | -4.123 | -1.212 |
| 2.387610416728146 | 7.079 | -4.208 | -1.147 |
| 2.393893602035326 | 7.137 | -4.293 | -1.08 |
| 2.400176787342505 | 7.196 | -4.38 | -1.012 |
| 2.406459972649685 | 7.255 | -4.466 | -0.942 |
| 2.412743157956865 | 7.314 | -4.554 | -0.871 |
| 2.419026343264044 | 7.372 | -4.642 | -0.798 |
| 2.425309528571224 | 7.431 | -4.73 | -0.724 |
| 2.431592713878404 | 7.49 | -4.819 | -0.648 |
| 2.437875899185583 | 7.549 | -4.909 | -0.571 |
| 2.444159084492763 | 7.608 | -4.999 | -0.492 |
| 2.450442269799943 | 7.667 | -5.09 | -0.411 |
| 2.456725455107122 | 7.726 | -5.181 | -0.33 |
| 2.463008640414302 | 7.785 | -5.272 | -0.247 |
| 2.469291825721482 | 7.844 | -5.364 | -0.162 |
| 2.475575011028661 | 7.903 | -5.457 | -0.076 |
| 2.481858196335841 | 7.961 | -5.549 | 0.012 |
| 2.48814138164302 | 8.02 | -5.643 | 0.1 |
| 2.4944245669502 | 8.079 | -5.736 | 0.191 |
| 2.50070775225738 | 8.138 | -5.83 | 0.282 |
| 2.506990937564559 | 8.197 | -5.925 | 0.375 |
| 2.51327412287174 | 8.255 | -6.019 | 0.469 |
| 2.519557308178919 | 8.314 | -6.114 | 0.565 |
| 2.525840493486098 | 8.372 | -6.21 | 0.662 |
| 2.532123678793278 | 8.431 | -6.305 | 0.76 |
| 2.538406864100458 | 8.489 | -6.401 | 0.859 |
| 2.544690049407637 | 8.547 | -6.497 | 0.959 |
| 2.550973234714817 | 8.606 | -6.594 | 1.061 |
| 2.557256420021996 | 8.664 | -6.69 | 1.164 |
| 2.563539605329176 | 8.721 | -6.787 | 1.268 |
| 2.569822790636356 | 8.779 | -6.884 | 1.373 |
| 2.576105975943535 | 8.837 | -6.981 | 1.479 |
| 2.582389161250715 | 8.894 | -7.078 | 1.586 |
| 2.588672346557895 | 8.952 | -7.176 | 1.694 |
| 2.594955531865074 | 9.009 | -7.273 | 1.803 |
| 2.601238717172254 | 9.066 | -7.371 | 1.913 |
| 2.607521902479433 | 9.123 | -7.468 | 2.024 |
| 2.613805087786613 | 9.179 | -7.566 | 2.136 |
| 2.620088273093793 | 9.236 | -7.664 | 2.248 |
| 2.626371458400972 | 9.292 | -7.761 | 2.362 |
| 2.632654643708152 | 9.348 | -7.859 | 2.476 |
| 2.638937829015332 | 9.404 | -7.956 | 2.591 |
| 2.645221014322511 | 9.459 | -8.054 | 2.706 |
| 2.651504199629691 | 9.514 | -8.151 | 2.822 |
| 2.657787384936871 | 9.569 | -8.248 | 2.939 |
| 2.66407057024405 | 9.624 | -8.345 | 3.057 |
| 2.67035375555123 | 9.678 | -8.442 | 3.175 |
| 2.67663694085841 | 9.733 | -8.539 | 3.293 |
| 2.682920126165589 | 9.787 | -8.635 | 3.412 |
| 2.689203311472769 | 9.84 | -8.732 | 3.531 |
| 2.695486496779948 | 9.893 | -8.828 | 3.651 |
| 2.701769682087128 | 9.946 | -8.923 | 3.771 |
| 2.708052867394308 | 9.999 | -9.019 | 3.891 |
| 2.714336052701487 | 10.051 | -9.114 | 4.011 |
| 2.720619238008667 | 10.103 | -9.208 | 4.132 |
| 2.726902423315847 | 10.155 | -9.302 | 4.252 |
| 2.733185608623026 | 10.206 | -9.396 | 4.373 |
| 2.739468793930206 | 10.256 | -9.489 | 4.494 |
| 2.745751979237386 | 10.307 | -9.582 | 4.614 |
| 2.752035164544565 | 10.357 | -9.674 | 4.735 |
| 2.758318349851745 | 10.406 | -9.766 | 4.855 |
| 2.764601535158925 | 10.455 | -9.857 | 4.975 |
| 2.770884720466104 | 10.504 | -9.948 | 5.095 |
| 2.777167905773284 | 10.552 | -10.038 | 5.215 |
| 2.783451091080463 | 10.6 | -10.127 | 5.335 |
| 2.789734276387643 | 10.647 | -10.216 | 5.453 |
| 2.796017461694823 | 10.694 | -10.304 | 5.572 |
| 2.802300647002002 | 10.74 | -10.391 | 5.69 |
| 2.808583832309182 | 10.786 | -10.477 | 5.807 |
| 2.814867017616362 | 10.831 | -10.563 | 5.924 |
| 2.821150202923541 | 10.876 | -10.648 | 6.04 |
| 2.827433388230721 | 10.92 | -10.732 | 6.155 |
| 2.833716573537901 | 10.964 | -10.815 | 6.27 |
| 2.83999975884508 | 11.007 | -10.897 | 6.383 |
| 2.84628294415226 | 11.049 | -10.978 | 6.496 |
| 2.852566129459439 | 11.091 | -11.058 | 6.608 |
| 2.858849314766619 | 11.132 | -11.137 | 6.718 |
| 2.865132500073799 | 11.173 | -11.215 | 6.828 |
| 2.871415685380978 | 11.213 | -11.292 | 6.936 |
| 2.877698870688158 | 11.252 | -11.368 | 7.044 |
| 2.883982055995337 | 11.291 | -11.443 | 7.149 |
| 2.890265241302517 | 11.329 | -11.517 | 7.254 |
| 2.896548426609697 | 11.367 | -11.589 | 7.357 |
| 2.902831611916877 | 11.403 | -11.661 | 7.459 |
| 2.909114797224056 | 11.439 | -11.731 | 7.559 |
| 2.915397982531236 | 11.475 | -11.799 | 7.658 |
| 2.921681167838416 | 11.509 | -11.867 | 7.754 |
| 2.927964353145595 | 11.543 | -11.933 | 7.85 |
| 2.934247538452775 | 11.576 | -11.997 | 7.943 |
| 2.940530723759954 | 11.608 | -12.061 | 8.035 |
| 2.946813909067134 | 11.64 | -12.123 | 8.124 |
| 2.953097094374314 | 11.67 | -12.183 | 8.212 |
| 2.959380279681493 | 11.7 | -12.242 | 8.298 |
| 2.965663464988673 | 11.729 | -12.299 | 8.381 |
| 2.971946650295853 | 11.758 | -12.355 | 8.463 |
| 2.978229835603032 | 11.785 | -12.409 | 8.542 |
| 2.984513020910212 | 11.812 | -12.461 | 8.619 |
| 2.990796206217391 | 11.837 | -12.512 | 8.694 |
| 2.997079391524571 | 11.862 | -12.561 | 8.766 |
| 3.003362576831751 | 11.886 | -12.608 | 8.836 |
| 3.009645762138931 | 11.909 | -12.654 | 8.903 |
| 3.01592894744611 | 11.931 | -12.698 | 8.968 |
| 3.02221213275329 | 11.952 | -12.74 | 9.03 |
| 3.028495318060469 | 11.973 | -12.78 | 9.089 |
| 3.034778503367649 | 11.992 | -12.818 | 9.146 |
| 3.041061688674829 | 12.01 | -12.854 | 9.2 |
| 3.047344873982008 | 12.027 | -12.888 | 9.251 |
| 3.053628059289188 | 12.043 | -12.921 | 9.299 |
| 3.059911244596367 | 12.059 | -12.951 | 9.344 |
| 3.066194429903547 | 12.073 | -12.979 | 9.386 |
| 3.072477615210727 | 12.086 | -13.005 | 9.425 |
| 3.078760800517906 | 12.098 | -13.03 | 9.461 |
| 3.085043985825086 | 12.109 | -13.051 | 9.494 |
| 3.091327171132266 | 12.119 | -13.071 | 9.524 |
| 3.097610356439445 | 12.128 | -13.089 | 9.55 |
| 3.103893541746625 | 12.135 | -13.104 | 9.573 |
| 3.110176727053805 | 12.142 | -13.117 | 9.592 |
| 3.116459912360984 | 12.147 | -13.128 | 9.608 |
| 3.122743097668164 | 12.151 | -13.136 | 9.621 |
| 3.129026282975343 | 12.154 | -13.142 | 9.63 |
| 3.135309468282523 | 12.156 | -13.146 | 9.635 |
| 3.141592653589703 | 12.157 | -13.147 | 9.637 |
| 3.147875838896883 | 12.156 | -13.146 | 9.635 |
| 3.154159024204062 | 12.154 | -13.142 | 9.63 |
| 3.160442209511242 | 12.151 | -13.136 | 9.621 |
| 3.166725394818422 | 12.147 | -13.127 | 9.607 |
| 3.173008580125601 | 12.141 | -13.116 | 9.591 |
| 3.179291765432781 | 12.134 | -13.102 | 9.57 |
| 3.18557495073996 | 12.126 | -13.085 | 9.545 |
| 3.19185813604714 | 12.116 | -13.066 | 9.516 |
| 3.19814132135432 | 12.105 | -13.044 | 9.484 |
| 3.2044245066615 | 12.093 | -13.02 | 9.447 |
| 3.210707691968679 | 12.079 | -12.992 | 9.406 |
| 3.216990877275859 | 12.064 | -12.962 | 9.361 |
| 3.223274062583038 | 12.048 | -12.93 | 9.312 |
| 3.229557247890217 | 12.03 | -12.894 | 9.259 |
| 3.235840433197398 | 12.011 | -12.856 | 9.202 |
| 3.242123618504577 | 11.99 | -12.814 | 9.14 |
| 3.248406803811757 | 11.968 | -12.77 | 9.075 |
| 3.254689989118936 | 11.944 | -12.723 | 9.005 |
| 3.260973174426116 | 11.919 | -12.673 | 8.93 |
| 3.267256359733296 | 11.892 | -12.62 | 8.852 |
| 3.273539545040475 | 11.864 | -12.564 | 8.769 |
| 3.279822730347655 | 11.834 | -12.505 | 8.682 |
| 3.286105915654835 | 11.803 | -12.443 | 8.59 |
| 3.292389100962014 | 11.77 | -12.378 | 8.495 |
| 3.298672286269194 | 11.735 | -12.31 | 8.394 |
| 3.304955471576374 | 11.699 | -12.238 | 8.29 |
| 3.311238656883553 | 11.662 | -12.164 | 8.181 |
| 3.317521842190732 | 11.622 | -12.086 | 8.067 |
| 3.323805027497912 | 11.581 | -12.006 | 7.95 |
| 3.330088212805092 | 11.539 | -11.922 | 7.828 |
| 3.336371398112272 | 11.494 | -11.835 | 7.701 |
| 3.342654583419451 | 11.448 | -11.745 | 7.57 |
| 3.34893776872663 | 11.401 | -11.651 | 7.435 |
| 3.355220954033811 | 11.351 | -11.555 | 7.295 |
| 3.36150413934099 | 11.3 | -11.455 | 7.151 |
| 3.36778732464817 | 11.247 | -11.351 | 7.003 |
| 3.37407050995535 | 11.192 | -11.245 | 6.85 |
| 3.380353695262529 | 11.136 | -11.135 | 6.693 |
| 3.386636880569709 | 11.077 | -11.022 | 6.531 |
| 3.392920065876888 | 11.017 | -10.905 | 6.365 |
| 3.399203251184068 | 10.955 | -10.785 | 6.195 |
| 3.405486436491248 | 10.892 | -10.662 | 6.021 |
| 3.411769621798427 | 10.826 | -10.535 | 5.842 |
| 3.418052807105607 | 10.758 | -10.405 | 5.659 |
| 3.424335992412787 | 10.689 | -10.272 | 5.472 |
| 3.430619177719966 | 10.618 | -10.135 | 5.28 |
| 3.436902363027146 | 10.544 | -9.994 | 5.085 |
| 3.443185548334325 | 10.469 | -9.851 | 4.885 |
| 3.449468733641505 | 10.392 | -9.703 | 4.682 |
| 3.455751918948685 | 10.313 | -9.553 | 4.474 |
| 3.462035104255865 | 10.232 | -9.399 | 4.262 |
| 3.468318289563044 | 10.149 | -9.241 | 4.046 |
| 3.474601474870224 | 10.063 | -9.08 | 3.827 |
| 3.480884660177403 | 9.976 | -8.915 | 3.603 |
| 3.487167845484583 | 9.887 | -8.747 | 3.376 |
| 3.493451030791763 | 9.796 | -8.576 | 3.144 |
| 3.499734216098942 | 9.702 | -8.401 | 2.909 |
| 3.506017401406122 | 9.607 | -8.222 | 2.671 |
| 3.512300586713302 | 9.509 | -8.04 | 2.428 |
| 3.518583772020481 | 9.41 | -7.854 | 2.183 |
| 3.524866957327661 | 9.308 | -7.665 | 1.933 |
| 3.531150142634841 | 9.204 | -7.473 | 1.68 |
| 3.53743332794202 | 9.098 | -7.276 | 1.424 |
| 3.5437165132492 | 8.989 | -7.077 | 1.164 |
| 3.54999969855638 | 8.879 | -6.874 | 0.902 |
| 3.556282883863559 | 8.766 | -6.667 | 0.635 |
| 3.562566069170739 | 8.651 | -6.457 | 0.366 |
| 3.568849254477918 | 8.534 | -6.243 | 0.094 |
| 3.575132439785098 | 8.414 | -6.026 | -0.181 |
| 3.581415625092278 | 8.293 | -5.805 | -0.459 |
| 3.587698810399457 | 8.169 | -5.581 | -0.74 |
| 3.593981995706637 | 8.042 | -5.353 | -1.024 |
| 3.600265181013817 | 7.914 | -5.122 | -1.31 |
| 3.606548366320996 | 7.783 | -4.888 | -1.599 |
| 3.612831551628176 | 7.649 | -4.65 | -1.891 |
| 3.619114736935355 | 7.514 | -4.408 | -2.185 |
| 3.625397922242535 | 7.376 | -4.164 | -2.481 |
| 3.631681107549715 | 7.235 | -3.915 | -2.779 |
| 3.637964292856894 | 7.092 | -3.664 | -3.08 |
| 3.644247478164074 | 6.947 | -3.409 | -3.382 |
| 3.650530663471254 | 6.799 | -3.15 | -3.687 |
| 3.656813848778433 | 6.649 | -2.888 | -3.993 |
| 3.663097034085613 | 6.496 | -2.623 | -4.301 |
| 3.669380219392792 | 6.341 | -2.355 | -4.61 |
| 3.675663404699972 | 6.184 | -2.083 | -4.922 |
| 3.681946590007152 | 6.024 | -1.808 | -5.234 |
| 3.688229775314331 | 5.861 | -1.53 | -5.548 |
| 3.694512960621511 | 5.696 | -1.248 | -5.863 |
| 3.700796145928691 | 5.528 | -0.963 | -6.179 |
| 3.70707933123587 | 5.358 | -0.675 | -6.496 |
| 3.71336251654305 | 5.185 | -0.384 | -6.814 |
| 3.71964570185023 | 5.01 | -0.09 | -7.133 |
| 3.72592888715741 | 4.832 | 0.208 | -7.452 |
| 3.732212072464589 | 4.651 | 0.509 | -7.772 |
| 3.738495257771769 | 4.468 | 0.812 | -8.092 |
| 3.744778443078948 | 4.282 | 1.119 | -8.413 |
| 3.751061628386128 | 4.094 | 1.429 | -8.734 |
| 3.757344813693308 | 3.903 | 1.742 | -9.054 |
| 3.763627999000487 | 3.709 | 2.057 | -9.375 |
| 3.769911184307667 | 3.512 | 2.376 | -9.695 |
| 3.776194369614846 | 3.313 | 2.698 | -10.015 |
| 3.782477554922026 | 3.111 | 3.022 | -10.335 |
| 3.788760740229206 | 2.906 | 3.35 | -10.653 |
| 3.795043925536385 | 2.699 | 3.68 | -10.972 |
| 3.801327110843565 | 2.489 | 4.013 | -11.289 |
| 3.807610296150745 | 2.276 | 4.348 | -11.605 |
| 3.813893481457924 | 2.06 | 4.687 | -11.92 |
| 3.820176666765104 | 1.842 | 5.028 | -12.234 |
| 3.826459852072284 | 1.62 | 5.371 | -12.546 |
| 3.832743037379463 | 1.396 | 5.718 | -12.857 |
| 3.839026222686643 | 1.169 | 6.066 | -13.166 |
| 3.845309407993823 | 0.94 | 6.418 | -13.474 |
| 3.851592593301002 | 0.707 | 6.771 | -13.779 |
| 3.857875778608182 | 0.472 | 7.127 | -14.082 |
| 3.864158963915361 | 0.233 | 7.486 | -14.383 |
| 3.870442149222541 | -0.008 | 7.847 | -14.682 |
| 3.876725334529721 | -0.252 | 8.21 | -14.978 |
| 3.8830085198369 | -0.499 | 8.575 | -15.271 |
| 3.88929170514408 | -0.749 | 8.943 | -15.562 |
| 3.89557489045126 | -1.002 | 9.312 | -15.85 |
| 3.901858075758439 | -1.257 | 9.684 | -16.134 |
| 3.908141261065619 | -1.516 | 10.058 | -16.416 |
| 3.914424446372799 | -1.778 | 10.434 | -16.694 |
| 3.920707631679978 | -2.042 | 10.811 | -16.968 |
| 3.926990816987158 | -2.31 | 11.191 | -17.239 |
| 3.933274002294337 | -2.58 | 11.572 | -17.506 |
| 3.939557187601517 | -2.854 | 11.956 | -17.77 |
| 3.945840372908697 | -3.13 | 12.34 | -18.029 |
| 3.952123558215876 | -3.41 | 12.727 | -18.284 |
| 3.958406743523056 | -3.693 | 13.115 | -18.534 |
| 3.964689928830236 | -3.978 | 13.505 | -18.781 |
| 3.970973114137415 | -4.267 | 13.896 | -19.022 |
| 3.977256299444595 | -4.559 | 14.289 | -19.259 |
| 3.983539484751775 | -4.853 | 14.683 | -19.491 |
| 3.989822670058954 | -5.151 | 15.078 | -19.718 |
| 3.996105855366134 | -5.452 | 15.474 | -19.939 |
| 4.002389040673314 | -5.756 | 15.872 | -20.156 |
| 4.008672225980493 | -6.063 | 16.271 | -20.367 |
| 4.014955411287672 | -6.373 | 16.671 | -20.572 |
| 4.021238596594851 | -6.686 | 17.072 | -20.772 |
| 4.02752178190203 | -7.003 | 17.473 | -20.966 |
| 4.03380496720921 | -7.322 | 17.876 | -21.154 |
| 4.040088152516389 | -7.645 | 18.28 | -21.336 |
| 4.046371337823567 | -7.971 | 18.684 | -21.511 |
| 4.052654523130747 | -8.299 | 19.088 | -21.68 |
| 4.058937708437926 | -8.631 | 19.494 | -21.843 |
| 4.065220893745105 | -8.967 | 19.9 | -22 |
| 4.071504079052285 | -9.305 | 20.306 | -22.149 |
| 4.077787264359464 | -9.646 | 20.713 | -22.292 |
| 4.084070449666643 | -9.991 | 21.12 | -22.428 |
| 4.090353634973822 | -10.339 | 21.527 | -22.556 |
| 4.096636820281001 | -10.69 | 21.934 | -22.678 |
| 4.102920005588181 | -11.044 | 22.341 | -22.792 |
| 4.10920319089536 | -11.402 | 22.749 | -22.899 |
| 4.115486376202539 | -11.762 | 23.156 | -22.998 |
| 4.121769561509718 | -12.126 | 23.563 | -23.09 |
| 4.128052746816897 | -12.493 | 23.97 | -23.174 |
| 4.134335932124077 | -12.864 | 24.377 | -23.25 |
| 4.140619117431256 | -13.237 | 24.783 | -23.318 |
| 4.146902302738435 | -13.614 | 25.188 | -23.379 |
| 4.153185488045614 | -13.994 | 25.594 | -23.431 |
| 4.159468673352793 | -14.377 | 25.998 | -23.475 |
| 4.165751858659973 | -14.763 | 26.402 | -23.51 |
| 4.172035043967152 | -15.153 | 26.805 | -23.537 |
| 4.178318229274331 | -15.546 | 27.207 | -23.556 |
| 4.18460141458151 | -15.942 | 27.608 | -23.566 |
| 4.190884599888689 | -16.341 | 28.008 | -23.567 |
| 4.197167785195868 | -16.744 | 28.407 | -23.56 |
| 4.203450970503048 | -17.15 | 28.805 | -23.544 |
| 4.209734155810227 | -17.559 | 29.201 | -23.519 |
| 4.216017341117406 | -17.971 | 29.596 | -23.485 |
| 4.222300526424585 | -18.387 | 29.99 | -23.442 |
| 4.228583711731764 | -18.806 | 30.382 | -23.39 |
| 4.234866897038944 | -19.228 | 30.773 | -23.329 |
| 4.241150082346122 | -19.654 | 31.161 | -23.259 |
| 4.247433267653302 | -20.082 | 31.548 | -23.179 |
| 4.253716452960481 | -20.514 | 31.933 | -23.09 |
| 4.25999963826766 | -20.95 | 32.316 | -22.992 |
| 4.26628282357484 | -21.388 | 32.697 | -22.884 |
| 4.272566008882019 | -21.83 | 33.076 | -22.767 |
| 4.278849194189198 | -22.275 | 33.452 | -22.64 |
| 4.285132379496377 | -22.723 | 33.826 | -22.504 |
| 4.291415564803557 | -23.175 | 34.198 | -22.359 |
| 4.297698750110735 | -23.63 | 34.567 | -22.203 |
| 4.303981935417915 | -24.088 | 34.933 | -22.038 |
| 4.310265120725094 | -24.549 | 35.297 | -21.864 |
| 4.316548306032273 | -25.014 | 35.658 | -21.68 |
| 4.322831491339452 | -25.482 | 36.016 | -21.486 |
| 4.329114676646632 | -25.953 | 36.371 | -21.282 |
| 4.335397861953811 | -26.427 | 36.724 | -21.069 |
| 4.34168104726099 | -26.905 | 37.072 | -20.847 |
| 4.347964232568169 | -27.386 | 37.418 | -20.614 |
| 4.354247417875348 | -27.87 | 37.76 | -20.372 |
| 4.360530603182528 | -28.357 | 38.099 | -20.12 |
| 4.366813788489707 | -28.848 | 38.434 | -19.858 |
| 4.373096973796886 | -29.342 | 38.766 | -19.587 |
| 4.379380159104065 | -29.839 | 39.094 | -19.307 |
| 4.385663344411244 | -30.339 | 39.418 | -19.016 |
| 4.391946529718424 | -30.843 | 39.739 | -18.716 |
| 4.398229715025602 | -31.35 | 40.055 | -18.407 |
| 4.404512900332782 | -31.86 | 40.367 | -18.088 |
| 4.41079608563996 | -32.373 | 40.675 | -17.759 |
| 4.41707927094714 | -32.89 | 40.979 | -17.422 |
| 4.42336245625432 | -33.409 | 41.278 | -17.074 |
| 4.429645641561499 | -33.932 | 41.573 | -16.718 |
| 4.435928826868678 | -34.458 | 41.863 | -16.352 |
| 4.442212012175857 | -34.987 | 42.149 | -15.977 |
| 4.448495197483036 | -35.52 | 42.43 | -15.593 |
| 4.454778382790215 | -36.055 | 42.706 | -15.2 |
| 4.461061568097395 | -36.594 | 42.977 | -14.798 |
| 4.467344753404574 | -37.136 | 43.243 | -14.387 |
| 4.473627938711753 | -37.681 | 43.504 | -13.967 |
| 4.479911124018932 | -38.229 | 43.76 | -13.538 |
| 4.486194309326112 | -38.78 | 44.011 | -13.101 |
| 4.49247749463329 | -39.335 | 44.256 | -12.655 |
| 4.49876067994047 | -39.892 | 44.496 | -12.2 |
| 4.50504386524765 | -40.453 | 44.73 | -11.738 |
| 4.511327050554828 | -41.017 | 44.959 | -11.267 |
| 4.517610235862008 | -41.583 | 45.182 | -10.788 |
| 4.523893421169186 | -42.153 | 45.399 | -10.3 |
| 4.530176606476366 | -42.726 | 45.61 | -9.805 |
| 4.536459791783545 | -43.302 | 45.815 | -9.302 |
| 4.542742977090724 | -43.881 | 46.015 | -8.792 |
| 4.549026162397904 | -44.463 | 46.207 | -8.274 |
| 4.555309347705083 | -45.048 | 46.394 | -7.748 |
| 4.561592533012262 | -45.637 | 46.575 | -7.215 |
| 4.567875718319441 | -46.228 | 46.748 | -6.675 |
| 4.57415890362662 | -46.822 | 46.916 | -6.128 |
| 4.5804420889338 | -47.419 | 47.077 | -5.575 |
| 4.586725274240979 | -48.019 | 47.231 | -5.014 |
| 4.593008459548158 | -48.622 | 47.378 | -4.447 |
| 4.599291644855337 | -49.228 | 47.519 | -3.874 |
| 4.605574830162516 | -49.837 | 47.652 | -3.294 |
| 4.611858015469695 | -50.448 | 47.779 | -2.709 |
| 4.618141200776875 | -51.063 | 47.899 | -2.117 |
| 4.624424386084054 | -51.681 | 48.011 | -1.52 |
| 4.630707571391233 | -52.301 | 48.116 | -0.918 |
| 4.636990756698412 | -52.924 | 48.214 | -0.31 |
| 4.643273942005591 | -53.55 | 48.304 | 0.303 |
| 4.649557127312771 | -54.179 | 48.387 | 0.921 |
| 4.65584031261995 | -54.811 | 48.462 | 1.544 |
| 4.66212349792713 | -55.445 | 48.53 | 2.171 |
| 4.668406683234308 | -56.083 | 48.59 | 2.803 |
| 4.674689868541487 | -56.723 | 48.643 | 3.438 |
| 4.680973053848666 | -57.366 | 48.687 | 4.078 |
| 4.687256239155846 | -58.011 | 48.723 | 4.722 |
| 4.693539424463024 | -58.659 | 48.752 | 5.368 |
| 4.699822609770204 | -59.31 | 48.772 | 6.019 |
| 4.706105795077383 | -59.964 | 48.785 | 6.672 |
| 4.712388980384562 | -60.62 | 48.789 | 7.328 |
| 4.718672165691741 | -61.279 | 48.785 | 7.987 |
| 4.724955350998921 | -61.94 | 48.772 | 8.648 |
| 4.7312385363061 | -62.604 | 48.751 | 9.311 |
| 4.73752172161328 | -63.271 | 48.722 | 9.977 |
| 4.743804906920459 | -63.94 | 48.684 | 10.644 |
| 4.750088092227637 | -64.612 | 48.638 | 11.312 |
| 4.756371277534817 | -65.286 | 48.583 | 11.982 |
| 4.762654462841996 | -65.962 | 48.519 | 12.653 |
| 4.768937648149175 | -66.642 | 48.446 | 13.324 |
| 4.775220833456354 | -67.323 | 48.365 | 13.996 |
| 4.781504018763534 | -68.007 | 48.275 | 14.668 |
| 4.787787204070713 | -68.694 | 48.176 | 15.34 |
| 4.794070389377892 | -69.382 | 48.068 | 16.012 |
| 4.800353574685071 | -70.074 | 47.951 | 16.683 |
| 4.806636759992251 | -70.767 | 47.824 | 17.354 |
| 4.81291994529943 | -71.463 | 47.689 | 18.023 |
| 4.819203130606608 | -72.161 | 47.545 | 18.691 |
| 4.825486315913788 | -72.861 | 47.391 | 19.358 |
| 4.831769501220967 | -73.564 | 47.228 | 20.023 |
| 4.838052686528146 | -74.269 | 47.056 | 20.686 |
| 4.844335871835326 | -74.976 | 46.874 | 21.346 |
| 4.850619057142505 | -75.685 | 46.683 | 22.004 |
| 4.856902242449684 | -76.396 | 46.483 | 22.658 |
| 4.863185427756863 | -77.11 | 46.273 | 23.31 |
| 4.869468613064042 | -77.825 | 46.053 | 23.958 |
| 4.875751798371221 | -78.543 | 45.824 | 24.603 |
| 4.882034983678401 | -79.262 | 45.586 | 25.243 |
| 4.88831816898558 | -79.984 | 45.338 | 25.88 |
| 4.894601354292759 | -80.708 | 45.08 | 26.511 |
| 4.900884539599939 | -81.433 | 44.812 | 27.138 |
| 4.907167724907117 | -82.161 | 44.535 | 27.76 |
| 4.913450910214297 | -82.89 | 44.248 | 28.377 |
| 4.919734095521476 | -83.621 | 43.952 | 28.988 |
| 4.926017280828655 | -84.354 | 43.646 | 29.593 |
| 4.932300466135834 | -85.089 | 43.329 | 30.192 |
| 4.938583651443014 | -85.826 | 43.004 | 30.784 |
| 4.944866836750193 | -86.564 | 42.668 | 31.37 |
| 4.951150022057372 | -87.304 | 42.322 | 31.949 |
| 4.957433207364551 | -88.046 | 41.967 | 32.52 |
| 4.96371639267173 | -88.79 | 41.602 | 33.084 |
| 4.96999957797891 | -89.535 | 41.226 | 33.64 |
| 4.976282763286088 | -90.281 | 40.841 | 34.189 |
| 4.982565948593268 | -91.03 | 40.447 | 34.728 |
| 4.988849133900447 | -91.779 | 40.042 | 35.26 |
| 4.995132319207626 | -92.531 | 39.627 | 35.782 |
| 5.001415504514805 | -93.283 | 39.203 | 36.295 |
| 5.007698689821984 | -94.038 | 38.768 | 36.799 |
| 5.013981875129164 | -94.793 | 38.324 | 37.293 |
| 5.020265060436343 | -95.55 | 37.87 | 37.778 |
| 5.026548245743522 | -96.308 | 37.405 | 38.252 |
| 5.032831431050702 | -97.068 | 36.931 | 38.716 |
| 5.039114616357881 | -97.829 | 36.448 | 39.169 |
| 5.04539780166506 | -98.591 | 35.954 | 39.611 |
| 5.05168098697224 | -99.354 | 35.45 | 40.042 |
| 5.057964172279418 | -100.118 | 34.937 | 40.462 |
| 5.064247357586598 | -100.884 | 34.414 | 40.87 |
| 5.070530542893777 | -101.651 | 33.881 | 41.266 |
| 5.076813728200956 | -102.418 | 33.338 | 41.65 |
| 5.083096913508135 | -103.187 | 32.786 | 42.022 |
| 5.089380098815314 | -103.956 | 32.224 | 42.381 |
| 5.095663284122493 | -104.727 | 31.652 | 42.727 |
| 5.101946469429673 | -105.499 | 31.07 | 43.06 |
| 5.108229654736852 | -106.271 | 30.479 | 43.38 |
| 5.114512840044031 | -107.044 | 29.879 | 43.686 |
| 5.12079602535121 | -107.818 | 29.268 | 43.979 |
| 5.12707921065839 | -108.593 | 28.649 | 44.258 |
| 5.133362395965568 | -109.368 | 28.019 | 44.523 |
| 5.139645581272747 | -110.144 | 27.381 | 44.773 |
| 5.145928766579927 | -110.921 | 26.732 | 45.009 |
| 5.152211951887106 | -111.698 | 26.075 | 45.23 |
| 5.158495137194286 | -112.476 | 25.408 | 45.436 |
| 5.164778322501465 | -113.254 | 24.732 | 45.627 |
| 5.171061507808644 | -114.033 | 24.047 | 45.803 |
| 5.177344693115823 | -114.812 | 23.353 | 45.963 |
| 5.183627878423002 | -115.592 | 22.649 | 46.108 |
| 5.189911063730181 | -116.372 | 21.937 | 46.237 |
| 5.196194249037361 | -117.152 | 21.215 | 46.35 |
| 5.20247743434454 | -117.932 | 20.485 | 46.447 |
| 5.20876061965172 | -118.713 | 19.745 | 46.528 |
| 5.215043804958898 | -119.494 | 18.997 | 46.592 |
| 5.221326990266077 | -120.275 | 18.241 | 46.64 |
| 5.227610175573257 | -121.056 | 17.475 | 46.671 |
| 5.233893360880435 | -121.837 | 16.701 | 46.685 |
| 5.240176546187615 | -122.618 | 15.919 | 46.682 |
| 5.246459731494794 | -123.399 | 15.128 | 46.662 |
| 5.252742916801973 | -124.18 | 14.328 | 46.625 |
| 5.259026102109152 | -124.961 | 13.521 | 46.57 |
| 5.265309287416332 | -125.742 | 12.705 | 46.499 |
| 5.27159247272351 | -126.522 | 11.881 | 46.409 |
| 5.27787565803069 | -127.302 | 11.049 | 46.302 |
| 5.284158843337869 | -128.082 | 10.21 | 46.178 |
| 5.290442028645049 | -128.861 | 9.362 | 46.035 |
| 5.296725213952227 | -129.64 | 8.507 | 45.875 |
| 5.303008399259407 | -130.419 | 7.644 | 45.697 |
| 5.309291584566586 | -131.197 | 6.773 | 45.501 |
| 5.315574769873765 | -131.974 | 5.895 | 45.287 |
| 5.321857955180945 | -132.751 | 5.01 | 45.054 |
| 5.328141140488124 | -133.527 | 4.117 | 44.804 |
| 5.334424325795303 | -134.303 | 3.217 | 44.535 |
| 5.340707511102482 | -135.078 | 2.31 | 44.249 |
| 5.346990696409661 | -135.851 | 1.397 | 43.944 |
| 5.35327388171684 | -136.625 | 0.476 | 43.621 |
| 5.35955706702402 | -137.397 | -0.451 | 43.28 |
| 5.365840252331199 | -138.168 | -1.385 | 42.92 |
| 5.372123437638378 | -138.938 | -2.325 | 42.542 |
| 5.378406622945557 | -139.707 | -3.272 | 42.146 |
| 5.384689808252737 | -140.475 | -4.225 | 41.732 |
| 5.390972993559916 | -141.242 | -5.184 | 41.3 |
| 5.397256178867095 | -142.008 | -6.149 | 40.849 |
| 5.403539364174274 | -142.773 | -7.12 | 40.381 |
| 5.409822549481453 | -143.536 | -8.096 | 39.894 |
| 5.416105734788632 | -144.298 | -9.079 | 39.39 |
| 5.422388920095812 | -145.058 | -10.066 | 38.867 |
| 5.42867210540299 | -145.817 | -11.059 | 38.327 |
| 5.43495529071017 | -146.574 | -12.058 | 37.769 |
| 5.44123847601735 | -147.33 | -13.061 | 37.193 |
| 5.447521661324528 | -148.084 | -14.069 | 36.599 |
| 5.453804846631708 | -148.837 | -15.082 | 35.988 |
| 5.460088031938887 | -149.588 | -16.1 | 35.36 |
| 5.466371217246066 | -150.337 | -17.122 | 34.715 |
| 5.472654402553245 | -151.084 | -18.148 | 34.052 |
| 5.478937587860424 | -151.829 | -19.179 | 33.372 |
| 5.485220773167603 | -152.573 | -20.213 | 32.675 |
| 5.491503958474783 | -153.314 | -21.252 | 31.962 |
| 5.497787143781962 | -154.053 | -22.294 | 31.232 |
| 5.504070329089141 | -154.791 | -23.34 | 30.485 |
| 5.51035351439632 | -155.526 | -24.389 | 29.723 |
| 5.5166366997035 | -156.259 | -25.442 | 28.944 |
| 5.522919885010679 | -156.989 | -26.498 | 28.149 |
| 5.529203070317858 | -157.717 | -27.556 | 27.338 |
| 5.535486255625037 | -158.443 | -28.618 | 26.512 |
| 5.541769440932216 | -159.167 | -29.682 | 25.671 |
| 5.548052626239396 | -159.888 | -30.748 | 24.814 |
| 5.554335811546575 | -160.606 | -31.817 | 23.943 |
| 5.560618996853754 | -161.322 | -32.887 | 23.056 |
| 5.566902182160933 | -162.035 | -33.96 | 22.156 |
| 5.573185367468112 | -162.745 | -35.035 | 21.241 |
| 5.579468552775292 | -163.453 | -36.111 | 20.312 |
| 5.585751738082471 | -164.157 | -37.188 | 19.369 |
| 5.59203492338965 | -164.859 | -38.267 | 18.413 |
| 5.59831810869683 | -165.558 | -39.347 | 17.444 |
| 5.604601294004008 | -166.254 | -40.427 | 16.461 |
| 5.610884479311188 | -166.947 | -41.509 | 15.466 |
| 5.617167664618367 | -167.636 | -42.59 | 14.459 |
| 5.623450849925546 | -168.323 | -43.673 | 13.439 |
| 5.629734035232725 | -169.006 | -44.755 | 12.408 |
| 5.636017220539904 | -169.686 | -45.837 | 11.365 |
| 5.642300405847083 | -170.362 | -46.919 | 10.311 |
| 5.648583591154263 | -171.036 | -48.001 | 9.246 |
| 5.654866776461442 | -171.705 | -49.082 | 8.171 |
| 5.661149961768621 | -172.371 | -50.162 | 7.085 |
| 5.6674331470758 | -173.034 | -51.241 | 5.99 |
| 5.673716332382979 | -173.692 | -52.319 | 4.885 |
| 5.679999517690159 | -174.347 | -53.395 | 3.771 |
| 5.686282702997337 | -174.999 | -54.47 | 2.647 |
| 5.692565888304517 | -175.646 | -55.544 | 1.516 |
| 5.698849073611696 | -176.29 | -56.615 | 0.376 |
| 5.705132258918875 | -176.929 | -57.684 | -0.771 |
| 5.711415444226055 | -177.565 | -58.75 | -1.926 |
| 5.717698629533234 | -178.196 | -59.814 | -3.088 |
| 5.723981814840413 | -178.823 | -60.876 | -4.256 |
| 5.730265000147592 | -179.446 | -61.934 | -5.431 |
| 5.73654818545477 | -180.065 | -62.989 | -6.612 |
| 5.742831370761951 | -180.679 | -64.041 | -7.798 |
| 5.74911455606913 | -181.289 | -65.089 | -8.989 |
| 5.75539774137631 | -181.895 | -66.133 | -10.184 |
| 5.761680926683488 | -182.496 | -67.174 | -11.384 |
| 5.767964111990667 | -183.092 | -68.21 | -12.588 |
| 5.774247297297846 | -183.684 | -69.241 | -13.794 |
| 5.780530482605025 | -184.271 | -70.268 | -15.004 |
| 5.786813667912205 | -184.853 | -71.291 | -16.217 |
| 5.793096853219384 | -185.431 | -72.308 | -17.431 |
| 5.799380038526563 | -186.003 | -73.32 | -18.647 |
| 5.805663223833742 | -186.571 | -74.326 | -19.865 |
| 5.811946409140922 | -187.133 | -75.327 | -21.083 |
| 5.8182295944481 | -187.691 | -76.322 | -22.301 |
| 5.82451277975528 | -188.243 | -77.311 | -23.52 |
| 5.830795965062459 | -188.79 | -78.294 | -24.737 |
| 5.837079150369638 | -189.332 | -79.27 | -25.954 |
| 5.843362335676817 | -189.868 | -80.239 | -27.169 |
| 5.849645520983997 | -190.399 | -81.201 | -28.382 |
| 5.855928706291176 | -190.925 | -82.157 | -29.593 |
| 5.862211891598355 | -191.445 | -83.105 | -30.801 |
| 5.868495076905535 | -191.96 | -84.045 | -32.005 |
| 5.874778262212714 | -192.468 | -84.978 | -33.206 |
| 5.881061447519893 | -192.971 | -85.902 | -34.402 |
| 5.887344632827072 | -193.469 | -86.819 | -35.594 |
| 5.893627818134251 | -193.96 | -87.727 | -36.781 |
| 5.899911003441431 | -194.446 | -88.626 | -37.961 |
| 5.90619418874861 | -194.925 | -89.517 | -39.136 |
| 5.912477374055789 | -195.399 | -90.399 | -40.304 |
| 5.918760559362968 | -195.866 | -91.271 | -41.464 |
| 5.925043744670147 | -196.327 | -92.134 | -42.618 |
| 5.931326929977326 | -196.782 | -92.987 | -43.763 |
| 5.937610115284505 | -197.231 | -93.831 | -44.899 |
| 5.943893300591684 | -197.673 | -94.664 | -46.027 |
| 5.950176485898864 | -198.109 | -95.487 | -47.145 |
| 5.956459671206043 | -198.539 | -96.299 | -48.253 |
| 5.962742856513223 | -198.962 | -97.101 | -49.35 |
| 5.969026041820402 | -199.378 | -97.892 | -50.437 |
| 5.975309227127581 | -199.787 | -98.672 | -51.512 |
| 5.98159241243476 | -200.19 | -99.441 | -52.576 |
| 5.987875597741939 | -200.586 | -100.198 | -53.627 |
| 5.994158783049118 | -200.975 | -100.943 | -54.665 |
| 6.000441968356298 | -201.358 | -101.676 | -55.69 |
| 6.006725153663476 | -201.733 | -102.398 | -56.702 |
| 6.013008338970656 | -202.101 | -103.107 | -57.699 |
| 6.019291524277835 | -202.462 | -103.803 | -58.681 |
| 6.025574709585015 | -202.816 | -104.487 | -59.649 |
| 6.031857894892193 | -203.162 | -105.158 | -60.6 |
| 6.038141080199372 | -203.502 | -105.815 | -61.536 |
| 6.044424265506552 | -203.834 | -106.46 | -62.456 |
| 6.050707450813731 | -204.158 | -107.091 | -63.358 |
| 6.05699063612091 | -204.475 | -107.708 | -64.243 |
| 6.06327382142809 | -204.784 | -108.311 | -65.111 |
| 6.069557006735269 | -205.086 | -108.9 | -65.96 |
| 6.075840192042448 | -205.38 | -109.475 | -66.791 |
| 6.082123377349627 | -205.666 | -110.036 | -67.602 |
| 6.088406562656806 | -205.945 | -110.582 | -68.394 |
| 6.094689747963986 | -206.215 | -111.113 | -69.167 |
| 6.100972933271164 | -206.478 | -111.629 | -69.919 |
| 6.107256118578344 | -206.732 | -112.13 | -70.65 |
| 6.113539303885523 | -206.979 | -112.616 | -71.36 |
| 6.119822489192702 | -207.217 | -113.086 | -72.049 |
| 6.126105674499882 | -207.447 | -113.54 | -72.716 |
| 6.132388859807061 | -207.669 | -113.978 | -73.36 |
| 6.13867204511424 | -207.882 | -114.401 | -73.982 |
| 6.144955230421419 | -208.087 | -114.807 | -74.581 |
| 6.151238415728598 | -208.284 | -115.196 | -75.157 |
| 6.157521601035778 | -208.472 | -115.57 | -75.709 |
| 6.163804786342957 | -208.652 | -115.926 | -76.237 |
| 6.170087971650136 | -208.823 | -116.266 | -76.74 |
| 6.176371156957315 | -208.985 | -116.588 | -77.219 |
| 6.182654342264494 | -209.138 | -116.893 | -77.673 |
| 6.188937527571674 | -209.283 | -117.181 | -78.101 |
| 6.195220712878853 | -209.419 | -117.451 | -78.504 |
| 6.201503898186032 | -209.545 | -117.704 | -78.881 |
| 6.207787083493211 | -209.663 | -117.939 | -79.231 |
| 6.21407026880039 | -209.772 | -118.155 | -79.555 |
| 6.22035345410757 | -209.871 | -118.354 | -79.852 |
| 6.226636639414749 | -209.962 | -118.535 | -80.121 |
| 6.232919824721928 | -210.043 | -118.696 | -80.364 |
| 6.239203010029107 | -210.115 | -118.84 | -80.578 |
| 6.245486195336286 | -210.177 | -118.965 | -80.765 |
| 6.251769380643465 | -210.23 | -119.07 | -80.924 |
| 6.258052565950644 | -210.273 | -119.157 | -81.054 |
| 6.264335751257824 | -210.307 | -119.225 | -81.156 |
| 6.270618936565003 | -210.332 | -119.274 | -81.229 |
| 6.276902121872182 | -210.346 | -119.303 | -81.272 |
| 6.283185307179361 | -210.351 | -119.313 | -81.287 |